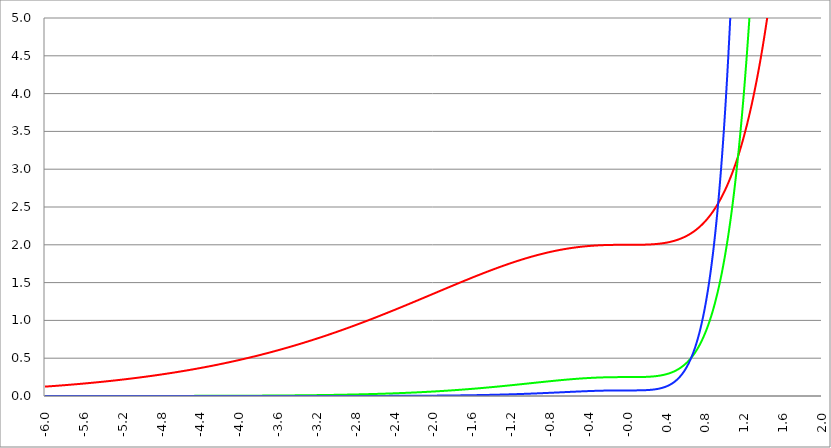
| Category | Series 1 | Series 0 | Series 2 |
|---|---|---|---|
| -6.0 | 0.124 | 0 | 0 |
| -5.996 | 0.124 | 0 | 0 |
| -5.992000000000001 | 0.125 | 0 | 0 |
| -5.988000000000001 | 0.125 | 0 | 0 |
| -5.984000000000002 | 0.125 | 0 | 0 |
| -5.980000000000002 | 0.126 | 0 | 0 |
| -5.976000000000002 | 0.126 | 0 | 0 |
| -5.972000000000003 | 0.126 | 0 | 0 |
| -5.968000000000003 | 0.127 | 0 | 0 |
| -5.964000000000004 | 0.127 | 0 | 0 |
| -5.960000000000004 | 0.128 | 0 | 0 |
| -5.956000000000004 | 0.128 | 0 | 0 |
| -5.952000000000005 | 0.128 | 0 | 0 |
| -5.948000000000005 | 0.129 | 0 | 0 |
| -5.944000000000006 | 0.129 | 0 | 0 |
| -5.940000000000006 | 0.129 | 0 | 0 |
| -5.936000000000007 | 0.13 | 0 | 0 |
| -5.932000000000007 | 0.13 | 0 | 0 |
| -5.928000000000008 | 0.131 | 0 | 0 |
| -5.924000000000008 | 0.131 | 0 | 0 |
| -5.920000000000009 | 0.131 | 0 | 0 |
| -5.91600000000001 | 0.132 | 0 | 0 |
| -5.91200000000001 | 0.132 | 0 | 0 |
| -5.90800000000001 | 0.132 | 0 | 0 |
| -5.904000000000011 | 0.133 | 0 | 0 |
| -5.900000000000011 | 0.133 | 0 | 0 |
| -5.896000000000011 | 0.134 | 0 | 0 |
| -5.892000000000012 | 0.134 | 0 | 0 |
| -5.888000000000012 | 0.134 | 0 | 0 |
| -5.884000000000013 | 0.135 | 0 | 0 |
| -5.880000000000013 | 0.135 | 0 | 0 |
| -5.876000000000014 | 0.135 | 0 | 0 |
| -5.872000000000014 | 0.136 | 0 | 0 |
| -5.868000000000014 | 0.136 | 0 | 0 |
| -5.864000000000015 | 0.137 | 0 | 0 |
| -5.860000000000015 | 0.137 | 0 | 0 |
| -5.856000000000016 | 0.137 | 0 | 0 |
| -5.852000000000016 | 0.138 | 0 | 0 |
| -5.848000000000017 | 0.138 | 0 | 0 |
| -5.844000000000017 | 0.139 | 0 | 0 |
| -5.840000000000018 | 0.139 | 0 | 0 |
| -5.836000000000018 | 0.139 | 0 | 0 |
| -5.832000000000018 | 0.14 | 0 | 0 |
| -5.828000000000019 | 0.14 | 0 | 0 |
| -5.824000000000019 | 0.141 | 0 | 0 |
| -5.82000000000002 | 0.141 | 0 | 0 |
| -5.81600000000002 | 0.141 | 0 | 0 |
| -5.812000000000021 | 0.142 | 0 | 0 |
| -5.808000000000021 | 0.142 | 0 | 0 |
| -5.804000000000022 | 0.143 | 0 | 0 |
| -5.800000000000022 | 0.143 | 0 | 0 |
| -5.796000000000022 | 0.143 | 0 | 0 |
| -5.792000000000023 | 0.144 | 0 | 0 |
| -5.788000000000023 | 0.144 | 0 | 0 |
| -5.784000000000024 | 0.145 | 0 | 0 |
| -5.780000000000024 | 0.145 | 0 | 0 |
| -5.776000000000024 | 0.145 | 0 | 0 |
| -5.772000000000025 | 0.146 | 0 | 0 |
| -5.768000000000025 | 0.146 | 0 | 0 |
| -5.764000000000026 | 0.147 | 0 | 0 |
| -5.760000000000026 | 0.147 | 0 | 0 |
| -5.756000000000026 | 0.148 | 0 | 0 |
| -5.752000000000027 | 0.148 | 0 | 0 |
| -5.748000000000027 | 0.148 | 0 | 0 |
| -5.744000000000028 | 0.149 | 0 | 0 |
| -5.740000000000028 | 0.149 | 0 | 0 |
| -5.73600000000003 | 0.15 | 0 | 0 |
| -5.73200000000003 | 0.15 | 0 | 0 |
| -5.72800000000003 | 0.151 | 0 | 0 |
| -5.72400000000003 | 0.151 | 0 | 0 |
| -5.720000000000031 | 0.151 | 0 | 0 |
| -5.716000000000031 | 0.152 | 0 | 0 |
| -5.712000000000032 | 0.152 | 0 | 0 |
| -5.708000000000032 | 0.153 | 0 | 0 |
| -5.704000000000033 | 0.153 | 0 | 0 |
| -5.700000000000033 | 0.154 | 0 | 0 |
| -5.696000000000033 | 0.154 | 0 | 0 |
| -5.692000000000034 | 0.154 | 0 | 0 |
| -5.688000000000034 | 0.155 | 0 | 0 |
| -5.684000000000035 | 0.155 | 0 | 0 |
| -5.680000000000035 | 0.156 | 0 | 0 |
| -5.676000000000035 | 0.156 | 0 | 0 |
| -5.672000000000036 | 0.157 | 0 | 0 |
| -5.668000000000036 | 0.157 | 0 | 0 |
| -5.664000000000037 | 0.158 | 0 | 0 |
| -5.660000000000037 | 0.158 | 0 | 0 |
| -5.656000000000038 | 0.158 | 0 | 0 |
| -5.652000000000038 | 0.159 | 0 | 0 |
| -5.648000000000039 | 0.159 | 0 | 0 |
| -5.644000000000039 | 0.16 | 0 | 0 |
| -5.64000000000004 | 0.16 | 0 | 0 |
| -5.63600000000004 | 0.161 | 0 | 0 |
| -5.63200000000004 | 0.161 | 0 | 0 |
| -5.628000000000041 | 0.162 | 0 | 0 |
| -5.624000000000041 | 0.162 | 0 | 0 |
| -5.620000000000042 | 0.162 | 0 | 0 |
| -5.616000000000042 | 0.163 | 0 | 0 |
| -5.612000000000043 | 0.163 | 0 | 0 |
| -5.608000000000043 | 0.164 | 0 | 0 |
| -5.604000000000044 | 0.164 | 0 | 0 |
| -5.600000000000044 | 0.165 | 0 | 0 |
| -5.596000000000044 | 0.165 | 0 | 0 |
| -5.592000000000045 | 0.166 | 0 | 0 |
| -5.588000000000045 | 0.166 | 0 | 0 |
| -5.584000000000046 | 0.167 | 0 | 0 |
| -5.580000000000046 | 0.167 | 0 | 0 |
| -5.576000000000046 | 0.168 | 0 | 0 |
| -5.572000000000047 | 0.168 | 0 | 0 |
| -5.568000000000048 | 0.169 | 0 | 0 |
| -5.564000000000048 | 0.169 | 0 | 0 |
| -5.560000000000048 | 0.169 | 0 | 0 |
| -5.556000000000049 | 0.17 | 0 | 0 |
| -5.552000000000049 | 0.17 | 0 | 0 |
| -5.54800000000005 | 0.171 | 0 | 0 |
| -5.54400000000005 | 0.171 | 0 | 0 |
| -5.540000000000051 | 0.172 | 0 | 0 |
| -5.536000000000051 | 0.172 | 0 | 0 |
| -5.532000000000052 | 0.173 | 0 | 0 |
| -5.528000000000052 | 0.173 | 0 | 0 |
| -5.524000000000052 | 0.174 | 0 | 0 |
| -5.520000000000053 | 0.174 | 0 | 0 |
| -5.516000000000053 | 0.175 | 0 | 0 |
| -5.512000000000054 | 0.175 | 0 | 0 |
| -5.508000000000054 | 0.176 | 0 | 0 |
| -5.504000000000055 | 0.176 | 0 | 0 |
| -5.500000000000055 | 0.177 | 0 | 0 |
| -5.496000000000055 | 0.177 | 0 | 0 |
| -5.492000000000056 | 0.178 | 0 | 0 |
| -5.488000000000056 | 0.178 | 0 | 0 |
| -5.484000000000057 | 0.179 | 0 | 0 |
| -5.480000000000057 | 0.179 | 0 | 0 |
| -5.476000000000057 | 0.18 | 0 | 0 |
| -5.472000000000058 | 0.18 | 0 | 0 |
| -5.468000000000059 | 0.181 | 0 | 0 |
| -5.464000000000059 | 0.181 | 0 | 0 |
| -5.460000000000059 | 0.182 | 0 | 0 |
| -5.45600000000006 | 0.182 | 0 | 0 |
| -5.45200000000006 | 0.183 | 0 | 0 |
| -5.44800000000006 | 0.183 | 0 | 0 |
| -5.444000000000061 | 0.184 | 0 | 0 |
| -5.440000000000061 | 0.184 | 0 | 0 |
| -5.436000000000062 | 0.185 | 0 | 0 |
| -5.432000000000062 | 0.185 | 0 | 0 |
| -5.428000000000063 | 0.186 | 0 | 0 |
| -5.424000000000063 | 0.186 | 0 | 0 |
| -5.420000000000064 | 0.187 | 0 | 0 |
| -5.416000000000064 | 0.187 | 0 | 0 |
| -5.412000000000064 | 0.188 | 0 | 0 |
| -5.408000000000065 | 0.188 | 0 | 0 |
| -5.404000000000065 | 0.189 | 0 | 0 |
| -5.400000000000066 | 0.19 | 0 | 0 |
| -5.396000000000066 | 0.19 | 0 | 0 |
| -5.392000000000067 | 0.191 | 0 | 0 |
| -5.388000000000067 | 0.191 | 0 | 0 |
| -5.384000000000068 | 0.192 | 0 | 0 |
| -5.380000000000068 | 0.192 | 0 | 0 |
| -5.376000000000068 | 0.193 | 0 | 0 |
| -5.37200000000007 | 0.193 | 0 | 0 |
| -5.36800000000007 | 0.194 | 0 | 0 |
| -5.36400000000007 | 0.194 | 0 | 0 |
| -5.36000000000007 | 0.195 | 0 | 0 |
| -5.356000000000071 | 0.195 | 0 | 0 |
| -5.352000000000071 | 0.196 | 0 | 0 |
| -5.348000000000072 | 0.196 | 0 | 0 |
| -5.344000000000072 | 0.197 | 0 | 0 |
| -5.340000000000073 | 0.198 | 0 | 0 |
| -5.336000000000073 | 0.198 | 0 | 0 |
| -5.332000000000074 | 0.199 | 0 | 0 |
| -5.328000000000074 | 0.199 | 0 | 0 |
| -5.324000000000074 | 0.2 | 0 | 0 |
| -5.320000000000075 | 0.2 | 0 | 0 |
| -5.316000000000075 | 0.201 | 0 | 0 |
| -5.312000000000076 | 0.201 | 0 | 0 |
| -5.308000000000076 | 0.202 | 0 | 0 |
| -5.304000000000077 | 0.203 | 0 | 0 |
| -5.300000000000077 | 0.203 | 0 | 0 |
| -5.296000000000077 | 0.204 | 0 | 0 |
| -5.292000000000078 | 0.204 | 0 | 0 |
| -5.288000000000078 | 0.205 | 0 | 0 |
| -5.284000000000079 | 0.205 | 0 | 0 |
| -5.28000000000008 | 0.206 | 0 | 0 |
| -5.27600000000008 | 0.206 | 0 | 0 |
| -5.27200000000008 | 0.207 | 0 | 0 |
| -5.268000000000081 | 0.208 | 0 | 0 |
| -5.264000000000081 | 0.208 | 0 | 0 |
| -5.260000000000081 | 0.209 | 0 | 0 |
| -5.256000000000082 | 0.209 | 0 | 0 |
| -5.252000000000082 | 0.21 | 0 | 0 |
| -5.248000000000083 | 0.211 | 0 | 0 |
| -5.244000000000083 | 0.211 | 0 | 0 |
| -5.240000000000084 | 0.212 | 0 | 0 |
| -5.236000000000084 | 0.212 | 0 | 0 |
| -5.232000000000084 | 0.213 | 0 | 0 |
| -5.228000000000085 | 0.213 | 0 | 0 |
| -5.224000000000085 | 0.214 | 0 | 0 |
| -5.220000000000086 | 0.215 | 0 | 0 |
| -5.216000000000086 | 0.215 | 0 | 0 |
| -5.212000000000087 | 0.216 | 0 | 0 |
| -5.208000000000087 | 0.216 | 0 | 0 |
| -5.204000000000088 | 0.217 | 0 | 0 |
| -5.200000000000088 | 0.218 | 0 | 0 |
| -5.196000000000089 | 0.218 | 0.001 | 0 |
| -5.192000000000089 | 0.219 | 0.001 | 0 |
| -5.188000000000089 | 0.219 | 0.001 | 0 |
| -5.18400000000009 | 0.22 | 0.001 | 0 |
| -5.18000000000009 | 0.221 | 0.001 | 0 |
| -5.176000000000091 | 0.221 | 0.001 | 0 |
| -5.172000000000091 | 0.222 | 0.001 | 0 |
| -5.168000000000092 | 0.222 | 0.001 | 0 |
| -5.164000000000092 | 0.223 | 0.001 | 0 |
| -5.160000000000092 | 0.224 | 0.001 | 0 |
| -5.156000000000093 | 0.224 | 0.001 | 0 |
| -5.152000000000093 | 0.225 | 0.001 | 0 |
| -5.148000000000094 | 0.225 | 0.001 | 0 |
| -5.144000000000094 | 0.226 | 0.001 | 0 |
| -5.140000000000095 | 0.227 | 0.001 | 0 |
| -5.136000000000095 | 0.227 | 0.001 | 0 |
| -5.132000000000096 | 0.228 | 0.001 | 0 |
| -5.128000000000096 | 0.229 | 0.001 | 0 |
| -5.124000000000096 | 0.229 | 0.001 | 0 |
| -5.120000000000097 | 0.23 | 0.001 | 0 |
| -5.116000000000097 | 0.23 | 0.001 | 0 |
| -5.112000000000098 | 0.231 | 0.001 | 0 |
| -5.108000000000098 | 0.232 | 0.001 | 0 |
| -5.104000000000099 | 0.232 | 0.001 | 0 |
| -5.100000000000099 | 0.233 | 0.001 | 0 |
| -5.0960000000001 | 0.234 | 0.001 | 0 |
| -5.0920000000001 | 0.234 | 0.001 | 0 |
| -5.0880000000001 | 0.235 | 0.001 | 0 |
| -5.084000000000101 | 0.236 | 0.001 | 0 |
| -5.080000000000101 | 0.236 | 0.001 | 0 |
| -5.076000000000101 | 0.237 | 0.001 | 0 |
| -5.072000000000102 | 0.237 | 0.001 | 0 |
| -5.068000000000103 | 0.238 | 0.001 | 0 |
| -5.064000000000103 | 0.239 | 0.001 | 0 |
| -5.060000000000104 | 0.239 | 0.001 | 0 |
| -5.056000000000104 | 0.24 | 0.001 | 0 |
| -5.052000000000104 | 0.241 | 0.001 | 0 |
| -5.048000000000104 | 0.241 | 0.001 | 0 |
| -5.044000000000105 | 0.242 | 0.001 | 0 |
| -5.040000000000105 | 0.243 | 0.001 | 0 |
| -5.036000000000106 | 0.243 | 0.001 | 0 |
| -5.032000000000106 | 0.244 | 0.001 | 0 |
| -5.028000000000107 | 0.245 | 0.001 | 0 |
| -5.024000000000107 | 0.245 | 0.001 | 0 |
| -5.020000000000108 | 0.246 | 0.001 | 0 |
| -5.016000000000108 | 0.247 | 0.001 | 0 |
| -5.012000000000109 | 0.247 | 0.001 | 0 |
| -5.00800000000011 | 0.248 | 0.001 | 0 |
| -5.00400000000011 | 0.249 | 0.001 | 0 |
| -5.00000000000011 | 0.249 | 0.001 | 0 |
| -4.99600000000011 | 0.25 | 0.001 | 0 |
| -4.992000000000111 | 0.251 | 0.001 | 0 |
| -4.988000000000111 | 0.251 | 0.001 | 0 |
| -4.984000000000112 | 0.252 | 0.001 | 0 |
| -4.980000000000112 | 0.253 | 0.001 | 0 |
| -4.976000000000112 | 0.253 | 0.001 | 0 |
| -4.972000000000113 | 0.254 | 0.001 | 0 |
| -4.968000000000114 | 0.255 | 0.001 | 0 |
| -4.964000000000114 | 0.255 | 0.001 | 0 |
| -4.960000000000114 | 0.256 | 0.001 | 0 |
| -4.956000000000114 | 0.257 | 0.001 | 0 |
| -4.952000000000115 | 0.258 | 0.001 | 0 |
| -4.948000000000115 | 0.258 | 0.001 | 0 |
| -4.944000000000116 | 0.259 | 0.001 | 0 |
| -4.940000000000116 | 0.26 | 0.001 | 0 |
| -4.936000000000117 | 0.26 | 0.001 | 0 |
| -4.932000000000117 | 0.261 | 0.001 | 0 |
| -4.928000000000118 | 0.262 | 0.001 | 0 |
| -4.924000000000118 | 0.262 | 0.001 | 0 |
| -4.920000000000119 | 0.263 | 0.001 | 0 |
| -4.91600000000012 | 0.264 | 0.001 | 0 |
| -4.91200000000012 | 0.265 | 0.001 | 0 |
| -4.90800000000012 | 0.265 | 0.001 | 0 |
| -4.90400000000012 | 0.266 | 0.001 | 0 |
| -4.90000000000012 | 0.267 | 0.001 | 0 |
| -4.896000000000121 | 0.267 | 0.001 | 0 |
| -4.892000000000122 | 0.268 | 0.001 | 0 |
| -4.888000000000122 | 0.269 | 0.001 | 0 |
| -4.884000000000123 | 0.27 | 0.001 | 0 |
| -4.880000000000123 | 0.27 | 0.001 | 0 |
| -4.876000000000123 | 0.271 | 0.001 | 0 |
| -4.872000000000124 | 0.272 | 0.001 | 0 |
| -4.868000000000124 | 0.272 | 0.001 | 0 |
| -4.864000000000125 | 0.273 | 0.001 | 0 |
| -4.860000000000125 | 0.274 | 0.001 | 0 |
| -4.856000000000125 | 0.275 | 0.001 | 0 |
| -4.852000000000126 | 0.275 | 0.001 | 0 |
| -4.848000000000126 | 0.276 | 0.001 | 0 |
| -4.844000000000127 | 0.277 | 0.001 | 0 |
| -4.840000000000127 | 0.278 | 0.001 | 0 |
| -4.836000000000128 | 0.278 | 0.001 | 0 |
| -4.832000000000128 | 0.279 | 0.001 | 0 |
| -4.82800000000013 | 0.28 | 0.001 | 0 |
| -4.824000000000129 | 0.281 | 0.001 | 0 |
| -4.82000000000013 | 0.281 | 0.001 | 0 |
| -4.81600000000013 | 0.282 | 0.001 | 0 |
| -4.812000000000131 | 0.283 | 0.001 | 0 |
| -4.808000000000131 | 0.284 | 0.001 | 0 |
| -4.804000000000132 | 0.284 | 0.001 | 0 |
| -4.800000000000132 | 0.285 | 0.001 | 0 |
| -4.796000000000132 | 0.286 | 0.001 | 0 |
| -4.792000000000133 | 0.287 | 0.001 | 0 |
| -4.788000000000133 | 0.287 | 0.001 | 0 |
| -4.784000000000134 | 0.288 | 0.001 | 0 |
| -4.780000000000134 | 0.289 | 0.001 | 0 |
| -4.776000000000134 | 0.29 | 0.001 | 0 |
| -4.772000000000135 | 0.29 | 0.001 | 0 |
| -4.768000000000135 | 0.291 | 0.001 | 0 |
| -4.764000000000136 | 0.292 | 0.001 | 0 |
| -4.760000000000136 | 0.293 | 0.001 | 0 |
| -4.756000000000136 | 0.294 | 0.001 | 0 |
| -4.752000000000137 | 0.294 | 0.001 | 0 |
| -4.748000000000137 | 0.295 | 0.001 | 0 |
| -4.744000000000138 | 0.296 | 0.001 | 0 |
| -4.740000000000138 | 0.297 | 0.001 | 0 |
| -4.73600000000014 | 0.297 | 0.001 | 0 |
| -4.73200000000014 | 0.298 | 0.001 | 0 |
| -4.72800000000014 | 0.299 | 0.001 | 0 |
| -4.72400000000014 | 0.3 | 0.001 | 0 |
| -4.720000000000141 | 0.301 | 0.001 | 0 |
| -4.716000000000141 | 0.301 | 0.001 | 0 |
| -4.712000000000142 | 0.302 | 0.001 | 0 |
| -4.708000000000142 | 0.303 | 0.001 | 0 |
| -4.704000000000143 | 0.304 | 0.001 | 0 |
| -4.700000000000143 | 0.305 | 0.001 | 0 |
| -4.696000000000143 | 0.305 | 0.001 | 0 |
| -4.692000000000144 | 0.306 | 0.001 | 0 |
| -4.688000000000144 | 0.307 | 0.001 | 0 |
| -4.684000000000145 | 0.308 | 0.001 | 0 |
| -4.680000000000145 | 0.309 | 0.001 | 0 |
| -4.676000000000145 | 0.309 | 0.001 | 0 |
| -4.672000000000146 | 0.31 | 0.001 | 0 |
| -4.668000000000147 | 0.311 | 0.001 | 0 |
| -4.664000000000147 | 0.312 | 0.001 | 0 |
| -4.660000000000147 | 0.313 | 0.001 | 0 |
| -4.656000000000148 | 0.314 | 0.001 | 0 |
| -4.652000000000148 | 0.314 | 0.001 | 0 |
| -4.648000000000149 | 0.315 | 0.001 | 0 |
| -4.644000000000149 | 0.316 | 0.001 | 0 |
| -4.64000000000015 | 0.317 | 0.001 | 0 |
| -4.63600000000015 | 0.318 | 0.001 | 0 |
| -4.632000000000151 | 0.319 | 0.001 | 0 |
| -4.628000000000151 | 0.319 | 0.001 | 0 |
| -4.624000000000151 | 0.32 | 0.001 | 0 |
| -4.620000000000152 | 0.321 | 0.001 | 0 |
| -4.616000000000152 | 0.322 | 0.001 | 0 |
| -4.612000000000153 | 0.323 | 0.001 | 0 |
| -4.608000000000153 | 0.324 | 0.001 | 0 |
| -4.604000000000154 | 0.324 | 0.001 | 0 |
| -4.600000000000154 | 0.325 | 0.001 | 0 |
| -4.596000000000154 | 0.326 | 0.001 | 0 |
| -4.592000000000155 | 0.327 | 0.001 | 0 |
| -4.588000000000155 | 0.328 | 0.001 | 0 |
| -4.584000000000156 | 0.329 | 0.001 | 0 |
| -4.580000000000156 | 0.33 | 0.001 | 0 |
| -4.576000000000156 | 0.33 | 0.001 | 0 |
| -4.572000000000157 | 0.331 | 0.001 | 0 |
| -4.568000000000158 | 0.332 | 0.001 | 0 |
| -4.564000000000158 | 0.333 | 0.001 | 0 |
| -4.560000000000159 | 0.334 | 0.001 | 0 |
| -4.55600000000016 | 0.335 | 0.001 | 0 |
| -4.552000000000159 | 0.336 | 0.001 | 0 |
| -4.54800000000016 | 0.337 | 0.001 | 0 |
| -4.54400000000016 | 0.337 | 0.001 | 0 |
| -4.54000000000016 | 0.338 | 0.001 | 0 |
| -4.53600000000016 | 0.339 | 0.001 | 0 |
| -4.532000000000161 | 0.34 | 0.001 | 0 |
| -4.528000000000162 | 0.341 | 0.001 | 0 |
| -4.524000000000163 | 0.342 | 0.001 | 0 |
| -4.520000000000163 | 0.343 | 0.002 | 0 |
| -4.516000000000163 | 0.344 | 0.002 | 0 |
| -4.512000000000164 | 0.344 | 0.002 | 0 |
| -4.508000000000164 | 0.345 | 0.002 | 0 |
| -4.504000000000164 | 0.346 | 0.002 | 0 |
| -4.500000000000165 | 0.347 | 0.002 | 0 |
| -4.496000000000165 | 0.348 | 0.002 | 0 |
| -4.492000000000166 | 0.349 | 0.002 | 0 |
| -4.488000000000166 | 0.35 | 0.002 | 0 |
| -4.484000000000166 | 0.351 | 0.002 | 0 |
| -4.480000000000167 | 0.352 | 0.002 | 0 |
| -4.476000000000167 | 0.353 | 0.002 | 0 |
| -4.472000000000168 | 0.354 | 0.002 | 0 |
| -4.468000000000168 | 0.354 | 0.002 | 0 |
| -4.46400000000017 | 0.355 | 0.002 | 0 |
| -4.46000000000017 | 0.356 | 0.002 | 0 |
| -4.45600000000017 | 0.357 | 0.002 | 0 |
| -4.45200000000017 | 0.358 | 0.002 | 0 |
| -4.44800000000017 | 0.359 | 0.002 | 0 |
| -4.444000000000171 | 0.36 | 0.002 | 0 |
| -4.440000000000171 | 0.361 | 0.002 | 0 |
| -4.436000000000172 | 0.362 | 0.002 | 0 |
| -4.432000000000172 | 0.363 | 0.002 | 0 |
| -4.428000000000173 | 0.364 | 0.002 | 0 |
| -4.424000000000174 | 0.365 | 0.002 | 0 |
| -4.420000000000174 | 0.366 | 0.002 | 0 |
| -4.416000000000174 | 0.366 | 0.002 | 0 |
| -4.412000000000174 | 0.367 | 0.002 | 0 |
| -4.408000000000175 | 0.368 | 0.002 | 0 |
| -4.404000000000175 | 0.369 | 0.002 | 0 |
| -4.400000000000176 | 0.37 | 0.002 | 0 |
| -4.396000000000176 | 0.371 | 0.002 | 0 |
| -4.392000000000177 | 0.372 | 0.002 | 0 |
| -4.388000000000177 | 0.373 | 0.002 | 0 |
| -4.384000000000178 | 0.374 | 0.002 | 0 |
| -4.380000000000178 | 0.375 | 0.002 | 0 |
| -4.376000000000178 | 0.376 | 0.002 | 0 |
| -4.37200000000018 | 0.377 | 0.002 | 0 |
| -4.36800000000018 | 0.378 | 0.002 | 0 |
| -4.36400000000018 | 0.379 | 0.002 | 0 |
| -4.360000000000181 | 0.38 | 0.002 | 0 |
| -4.356000000000181 | 0.381 | 0.002 | 0 |
| -4.352000000000181 | 0.382 | 0.002 | 0 |
| -4.348000000000182 | 0.383 | 0.002 | 0 |
| -4.344000000000182 | 0.384 | 0.002 | 0 |
| -4.340000000000183 | 0.385 | 0.002 | 0 |
| -4.336000000000183 | 0.386 | 0.002 | 0 |
| -4.332000000000184 | 0.387 | 0.002 | 0 |
| -4.328000000000184 | 0.388 | 0.002 | 0 |
| -4.324000000000185 | 0.389 | 0.002 | 0 |
| -4.320000000000185 | 0.39 | 0.002 | 0 |
| -4.316000000000185 | 0.391 | 0.002 | 0 |
| -4.312000000000186 | 0.392 | 0.002 | 0 |
| -4.308000000000186 | 0.393 | 0.002 | 0 |
| -4.304000000000187 | 0.394 | 0.002 | 0 |
| -4.300000000000187 | 0.395 | 0.002 | 0 |
| -4.296000000000187 | 0.396 | 0.002 | 0 |
| -4.292000000000188 | 0.397 | 0.002 | 0 |
| -4.288000000000188 | 0.398 | 0.002 | 0 |
| -4.284000000000189 | 0.399 | 0.002 | 0 |
| -4.28000000000019 | 0.4 | 0.002 | 0 |
| -4.27600000000019 | 0.401 | 0.002 | 0 |
| -4.27200000000019 | 0.402 | 0.002 | 0 |
| -4.268000000000191 | 0.403 | 0.002 | 0 |
| -4.264000000000191 | 0.404 | 0.002 | 0 |
| -4.260000000000192 | 0.405 | 0.002 | 0 |
| -4.256000000000192 | 0.406 | 0.002 | 0 |
| -4.252000000000192 | 0.407 | 0.002 | 0 |
| -4.248000000000193 | 0.408 | 0.002 | 0 |
| -4.244000000000193 | 0.409 | 0.002 | 0 |
| -4.240000000000194 | 0.41 | 0.002 | 0 |
| -4.236000000000194 | 0.411 | 0.002 | 0 |
| -4.232000000000194 | 0.412 | 0.002 | 0 |
| -4.228000000000195 | 0.413 | 0.002 | 0 |
| -4.224000000000196 | 0.414 | 0.002 | 0 |
| -4.220000000000196 | 0.415 | 0.002 | 0 |
| -4.216000000000196 | 0.416 | 0.002 | 0 |
| -4.212000000000197 | 0.417 | 0.002 | 0 |
| -4.208000000000197 | 0.418 | 0.002 | 0 |
| -4.204000000000198 | 0.419 | 0.002 | 0 |
| -4.200000000000198 | 0.42 | 0.003 | 0 |
| -4.196000000000199 | 0.422 | 0.003 | 0 |
| -4.192000000000199 | 0.423 | 0.003 | 0 |
| -4.1880000000002 | 0.424 | 0.003 | 0 |
| -4.1840000000002 | 0.425 | 0.003 | 0 |
| -4.1800000000002 | 0.426 | 0.003 | 0 |
| -4.176000000000201 | 0.427 | 0.003 | 0 |
| -4.172000000000201 | 0.428 | 0.003 | 0 |
| -4.168000000000202 | 0.429 | 0.003 | 0 |
| -4.164000000000202 | 0.43 | 0.003 | 0 |
| -4.160000000000203 | 0.431 | 0.003 | 0 |
| -4.156000000000203 | 0.432 | 0.003 | 0 |
| -4.152000000000204 | 0.433 | 0.003 | 0 |
| -4.148000000000204 | 0.434 | 0.003 | 0 |
| -4.144000000000204 | 0.436 | 0.003 | 0 |
| -4.140000000000205 | 0.437 | 0.003 | 0 |
| -4.136000000000205 | 0.438 | 0.003 | 0 |
| -4.132000000000206 | 0.439 | 0.003 | 0 |
| -4.128000000000206 | 0.44 | 0.003 | 0 |
| -4.124000000000207 | 0.441 | 0.003 | 0 |
| -4.120000000000207 | 0.442 | 0.003 | 0 |
| -4.116000000000207 | 0.443 | 0.003 | 0 |
| -4.112000000000208 | 0.444 | 0.003 | 0 |
| -4.108000000000208 | 0.445 | 0.003 | 0 |
| -4.104000000000209 | 0.447 | 0.003 | 0 |
| -4.100000000000209 | 0.448 | 0.003 | 0 |
| -4.09600000000021 | 0.449 | 0.003 | 0 |
| -4.09200000000021 | 0.45 | 0.003 | 0 |
| -4.088000000000211 | 0.451 | 0.003 | 0 |
| -4.084000000000211 | 0.452 | 0.003 | 0 |
| -4.080000000000211 | 0.453 | 0.003 | 0 |
| -4.076000000000212 | 0.454 | 0.003 | 0 |
| -4.072000000000212 | 0.455 | 0.003 | 0 |
| -4.068000000000213 | 0.457 | 0.003 | 0 |
| -4.064000000000213 | 0.458 | 0.003 | 0 |
| -4.060000000000214 | 0.459 | 0.003 | 0 |
| -4.056000000000214 | 0.46 | 0.003 | 0 |
| -4.052000000000215 | 0.461 | 0.003 | 0 |
| -4.048000000000215 | 0.462 | 0.003 | 0 |
| -4.044000000000215 | 0.463 | 0.003 | 0 |
| -4.040000000000216 | 0.465 | 0.003 | 0 |
| -4.036000000000216 | 0.466 | 0.003 | 0 |
| -4.032000000000217 | 0.467 | 0.003 | 0 |
| -4.028000000000217 | 0.468 | 0.003 | 0 |
| -4.024000000000218 | 0.469 | 0.003 | 0 |
| -4.020000000000218 | 0.47 | 0.003 | 0 |
| -4.016000000000219 | 0.472 | 0.003 | 0 |
| -4.012000000000219 | 0.473 | 0.003 | 0 |
| -4.008000000000219 | 0.474 | 0.003 | 0 |
| -4.00400000000022 | 0.475 | 0.003 | 0 |
| -4.00000000000022 | 0.476 | 0.003 | 0 |
| -3.99600000000022 | 0.477 | 0.003 | 0 |
| -3.99200000000022 | 0.479 | 0.003 | 0 |
| -3.98800000000022 | 0.48 | 0.004 | 0 |
| -3.98400000000022 | 0.481 | 0.004 | 0 |
| -3.98000000000022 | 0.482 | 0.004 | 0 |
| -3.97600000000022 | 0.483 | 0.004 | 0 |
| -3.97200000000022 | 0.484 | 0.004 | 0 |
| -3.96800000000022 | 0.486 | 0.004 | 0 |
| -3.96400000000022 | 0.487 | 0.004 | 0 |
| -3.96000000000022 | 0.488 | 0.004 | 0 |
| -3.95600000000022 | 0.489 | 0.004 | 0 |
| -3.95200000000022 | 0.49 | 0.004 | 0 |
| -3.94800000000022 | 0.492 | 0.004 | 0 |
| -3.94400000000022 | 0.493 | 0.004 | 0 |
| -3.94000000000022 | 0.494 | 0.004 | 0 |
| -3.93600000000022 | 0.495 | 0.004 | 0 |
| -3.93200000000022 | 0.496 | 0.004 | 0 |
| -3.92800000000022 | 0.498 | 0.004 | 0 |
| -3.92400000000022 | 0.499 | 0.004 | 0 |
| -3.92000000000022 | 0.5 | 0.004 | 0 |
| -3.91600000000022 | 0.501 | 0.004 | 0 |
| -3.91200000000022 | 0.503 | 0.004 | 0 |
| -3.90800000000022 | 0.504 | 0.004 | 0 |
| -3.90400000000022 | 0.505 | 0.004 | 0 |
| -3.90000000000022 | 0.506 | 0.004 | 0 |
| -3.89600000000022 | 0.507 | 0.004 | 0 |
| -3.89200000000022 | 0.509 | 0.004 | 0 |
| -3.88800000000022 | 0.51 | 0.004 | 0 |
| -3.88400000000022 | 0.511 | 0.004 | 0 |
| -3.88000000000022 | 0.512 | 0.004 | 0 |
| -3.87600000000022 | 0.514 | 0.004 | 0 |
| -3.87200000000022 | 0.515 | 0.004 | 0 |
| -3.86800000000022 | 0.516 | 0.004 | 0 |
| -3.86400000000022 | 0.517 | 0.004 | 0 |
| -3.86000000000022 | 0.519 | 0.004 | 0 |
| -3.85600000000022 | 0.52 | 0.004 | 0 |
| -3.85200000000022 | 0.521 | 0.004 | 0 |
| -3.84800000000022 | 0.522 | 0.004 | 0 |
| -3.84400000000022 | 0.524 | 0.004 | 0 |
| -3.84000000000022 | 0.525 | 0.004 | 0 |
| -3.83600000000022 | 0.526 | 0.004 | 0 |
| -3.83200000000022 | 0.528 | 0.004 | 0 |
| -3.82800000000022 | 0.529 | 0.004 | 0 |
| -3.82400000000022 | 0.53 | 0.005 | 0 |
| -3.82000000000022 | 0.531 | 0.005 | 0 |
| -3.81600000000022 | 0.533 | 0.005 | 0 |
| -3.81200000000022 | 0.534 | 0.005 | 0 |
| -3.80800000000022 | 0.535 | 0.005 | 0 |
| -3.80400000000022 | 0.537 | 0.005 | 0 |
| -3.80000000000022 | 0.538 | 0.005 | 0 |
| -3.79600000000022 | 0.539 | 0.005 | 0 |
| -3.79200000000022 | 0.54 | 0.005 | 0 |
| -3.78800000000022 | 0.542 | 0.005 | 0 |
| -3.78400000000022 | 0.543 | 0.005 | 0 |
| -3.78000000000022 | 0.544 | 0.005 | 0 |
| -3.77600000000022 | 0.546 | 0.005 | 0 |
| -3.77200000000022 | 0.547 | 0.005 | 0 |
| -3.76800000000022 | 0.548 | 0.005 | 0 |
| -3.76400000000022 | 0.55 | 0.005 | 0 |
| -3.76000000000022 | 0.551 | 0.005 | 0 |
| -3.75600000000022 | 0.552 | 0.005 | 0 |
| -3.75200000000022 | 0.553 | 0.005 | 0 |
| -3.74800000000022 | 0.555 | 0.005 | 0 |
| -3.74400000000022 | 0.556 | 0.005 | 0 |
| -3.74000000000022 | 0.557 | 0.005 | 0 |
| -3.73600000000022 | 0.559 | 0.005 | 0 |
| -3.73200000000022 | 0.56 | 0.005 | 0 |
| -3.72800000000022 | 0.561 | 0.005 | 0 |
| -3.72400000000022 | 0.563 | 0.005 | 0 |
| -3.72000000000022 | 0.564 | 0.005 | 0 |
| -3.71600000000022 | 0.565 | 0.005 | 0 |
| -3.71200000000022 | 0.567 | 0.005 | 0 |
| -3.70800000000022 | 0.568 | 0.005 | 0 |
| -3.70400000000022 | 0.57 | 0.005 | 0 |
| -3.70000000000022 | 0.571 | 0.005 | 0 |
| -3.69600000000022 | 0.572 | 0.006 | 0 |
| -3.69200000000022 | 0.574 | 0.006 | 0 |
| -3.68800000000022 | 0.575 | 0.006 | 0 |
| -3.68400000000022 | 0.576 | 0.006 | 0 |
| -3.68000000000022 | 0.578 | 0.006 | 0 |
| -3.67600000000022 | 0.579 | 0.006 | 0 |
| -3.67200000000022 | 0.58 | 0.006 | 0 |
| -3.66800000000022 | 0.582 | 0.006 | 0 |
| -3.66400000000022 | 0.583 | 0.006 | 0 |
| -3.66000000000022 | 0.585 | 0.006 | 0 |
| -3.65600000000022 | 0.586 | 0.006 | 0 |
| -3.65200000000022 | 0.587 | 0.006 | 0 |
| -3.64800000000022 | 0.589 | 0.006 | 0 |
| -3.64400000000022 | 0.59 | 0.006 | 0 |
| -3.64000000000022 | 0.591 | 0.006 | 0 |
| -3.63600000000022 | 0.593 | 0.006 | 0 |
| -3.63200000000022 | 0.594 | 0.006 | 0 |
| -3.62800000000022 | 0.596 | 0.006 | 0 |
| -3.62400000000022 | 0.597 | 0.006 | 0 |
| -3.62000000000022 | 0.598 | 0.006 | 0 |
| -3.61600000000022 | 0.6 | 0.006 | 0 |
| -3.61200000000022 | 0.601 | 0.006 | 0 |
| -3.60800000000022 | 0.603 | 0.006 | 0 |
| -3.60400000000022 | 0.604 | 0.006 | 0 |
| -3.60000000000022 | 0.605 | 0.006 | 0 |
| -3.59600000000022 | 0.607 | 0.006 | 0 |
| -3.59200000000022 | 0.608 | 0.006 | 0 |
| -3.58800000000022 | 0.61 | 0.006 | 0 |
| -3.58400000000022 | 0.611 | 0.007 | 0 |
| -3.58000000000022 | 0.613 | 0.007 | 0 |
| -3.57600000000022 | 0.614 | 0.007 | 0 |
| -3.57200000000022 | 0.615 | 0.007 | 0 |
| -3.56800000000022 | 0.617 | 0.007 | 0 |
| -3.56400000000022 | 0.618 | 0.007 | 0 |
| -3.56000000000022 | 0.62 | 0.007 | 0 |
| -3.55600000000022 | 0.621 | 0.007 | 0 |
| -3.55200000000022 | 0.623 | 0.007 | 0 |
| -3.54800000000022 | 0.624 | 0.007 | 0 |
| -3.54400000000022 | 0.626 | 0.007 | 0 |
| -3.54000000000022 | 0.627 | 0.007 | 0 |
| -3.53600000000022 | 0.628 | 0.007 | 0 |
| -3.53200000000022 | 0.63 | 0.007 | 0 |
| -3.52800000000022 | 0.631 | 0.007 | 0 |
| -3.52400000000022 | 0.633 | 0.007 | 0 |
| -3.52000000000022 | 0.634 | 0.007 | 0 |
| -3.51600000000022 | 0.636 | 0.007 | 0 |
| -3.51200000000022 | 0.637 | 0.007 | 0 |
| -3.50800000000022 | 0.639 | 0.007 | 0 |
| -3.50400000000022 | 0.64 | 0.007 | 0 |
| -3.50000000000022 | 0.642 | 0.007 | 0 |
| -3.49600000000022 | 0.643 | 0.007 | 0 |
| -3.49200000000022 | 0.645 | 0.007 | 0 |
| -3.48800000000022 | 0.646 | 0.008 | 0 |
| -3.48400000000022 | 0.648 | 0.008 | 0 |
| -3.48000000000022 | 0.649 | 0.008 | 0 |
| -3.47600000000022 | 0.651 | 0.008 | 0 |
| -3.47200000000022 | 0.652 | 0.008 | 0 |
| -3.46800000000022 | 0.654 | 0.008 | 0 |
| -3.46400000000022 | 0.655 | 0.008 | 0 |
| -3.46000000000022 | 0.657 | 0.008 | 0 |
| -3.45600000000022 | 0.658 | 0.008 | 0 |
| -3.45200000000022 | 0.66 | 0.008 | 0 |
| -3.44800000000022 | 0.661 | 0.008 | 0 |
| -3.44400000000022 | 0.663 | 0.008 | 0 |
| -3.44000000000022 | 0.664 | 0.008 | 0 |
| -3.43600000000022 | 0.666 | 0.008 | 0 |
| -3.43200000000022 | 0.667 | 0.008 | 0 |
| -3.42800000000022 | 0.669 | 0.008 | 0 |
| -3.42400000000022 | 0.67 | 0.008 | 0 |
| -3.42000000000022 | 0.672 | 0.008 | 0 |
| -3.41600000000022 | 0.673 | 0.008 | 0 |
| -3.41200000000022 | 0.675 | 0.008 | 0 |
| -3.40800000000022 | 0.676 | 0.009 | 0 |
| -3.40400000000022 | 0.678 | 0.009 | 0 |
| -3.40000000000022 | 0.679 | 0.009 | 0 |
| -3.39600000000022 | 0.681 | 0.009 | 0 |
| -3.39200000000022 | 0.683 | 0.009 | 0 |
| -3.38800000000022 | 0.684 | 0.009 | 0 |
| -3.38400000000022 | 0.686 | 0.009 | 0 |
| -3.38000000000022 | 0.687 | 0.009 | 0 |
| -3.37600000000022 | 0.689 | 0.009 | 0 |
| -3.37200000000022 | 0.69 | 0.009 | 0 |
| -3.36800000000022 | 0.692 | 0.009 | 0 |
| -3.36400000000022 | 0.693 | 0.009 | 0 |
| -3.36000000000022 | 0.695 | 0.009 | 0 |
| -3.35600000000022 | 0.697 | 0.009 | 0 |
| -3.35200000000022 | 0.698 | 0.009 | 0 |
| -3.34800000000022 | 0.7 | 0.009 | 0 |
| -3.34400000000022 | 0.701 | 0.009 | 0 |
| -3.34000000000022 | 0.703 | 0.009 | 0 |
| -3.33600000000022 | 0.704 | 0.009 | 0 |
| -3.33200000000022 | 0.706 | 0.01 | 0 |
| -3.32800000000022 | 0.708 | 0.01 | 0 |
| -3.32400000000022 | 0.709 | 0.01 | 0 |
| -3.32000000000022 | 0.711 | 0.01 | 0 |
| -3.31600000000022 | 0.712 | 0.01 | 0 |
| -3.31200000000022 | 0.714 | 0.01 | 0 |
| -3.30800000000022 | 0.716 | 0.01 | 0 |
| -3.30400000000022 | 0.717 | 0.01 | 0 |
| -3.30000000000022 | 0.719 | 0.01 | 0 |
| -3.29600000000022 | 0.72 | 0.01 | 0 |
| -3.29200000000022 | 0.722 | 0.01 | 0 |
| -3.28800000000022 | 0.724 | 0.01 | 0 |
| -3.28400000000022 | 0.725 | 0.01 | 0 |
| -3.28000000000022 | 0.727 | 0.01 | 0 |
| -3.27600000000022 | 0.729 | 0.01 | 0 |
| -3.27200000000022 | 0.73 | 0.01 | 0 |
| -3.26800000000022 | 0.732 | 0.01 | 0 |
| -3.26400000000022 | 0.733 | 0.011 | 0 |
| -3.26000000000022 | 0.735 | 0.011 | 0 |
| -3.25600000000022 | 0.737 | 0.011 | 0 |
| -3.25200000000022 | 0.738 | 0.011 | 0 |
| -3.24800000000022 | 0.74 | 0.011 | 0 |
| -3.24400000000022 | 0.742 | 0.011 | 0 |
| -3.24000000000022 | 0.743 | 0.011 | 0 |
| -3.23600000000022 | 0.745 | 0.011 | 0 |
| -3.23200000000022 | 0.747 | 0.011 | 0 |
| -3.22800000000022 | 0.748 | 0.011 | 0 |
| -3.22400000000022 | 0.75 | 0.011 | 0 |
| -3.22000000000022 | 0.751 | 0.011 | 0 |
| -3.21600000000022 | 0.753 | 0.011 | 0 |
| -3.21200000000022 | 0.755 | 0.011 | 0 |
| -3.20800000000022 | 0.756 | 0.011 | 0 |
| -3.20400000000022 | 0.758 | 0.012 | 0 |
| -3.20000000000022 | 0.76 | 0.012 | 0 |
| -3.19600000000022 | 0.761 | 0.012 | 0 |
| -3.19200000000022 | 0.763 | 0.012 | 0 |
| -3.18800000000022 | 0.765 | 0.012 | 0 |
| -3.18400000000022 | 0.767 | 0.012 | 0 |
| -3.18000000000022 | 0.768 | 0.012 | 0 |
| -3.17600000000022 | 0.77 | 0.012 | 0 |
| -3.17200000000022 | 0.772 | 0.012 | 0 |
| -3.16800000000022 | 0.773 | 0.012 | 0 |
| -3.16400000000022 | 0.775 | 0.012 | 0 |
| -3.16000000000022 | 0.777 | 0.012 | 0 |
| -3.15600000000022 | 0.778 | 0.012 | 0 |
| -3.152000000000219 | 0.78 | 0.012 | 0 |
| -3.148000000000219 | 0.782 | 0.012 | 0 |
| -3.144000000000219 | 0.783 | 0.013 | 0 |
| -3.140000000000219 | 0.785 | 0.013 | 0 |
| -3.136000000000219 | 0.787 | 0.013 | 0 |
| -3.132000000000219 | 0.789 | 0.013 | 0 |
| -3.128000000000219 | 0.79 | 0.013 | 0 |
| -3.124000000000219 | 0.792 | 0.013 | 0 |
| -3.120000000000219 | 0.794 | 0.013 | 0 |
| -3.116000000000219 | 0.795 | 0.013 | 0 |
| -3.112000000000219 | 0.797 | 0.013 | 0 |
| -3.108000000000219 | 0.799 | 0.013 | 0 |
| -3.104000000000219 | 0.801 | 0.013 | 0 |
| -3.100000000000219 | 0.802 | 0.013 | 0 |
| -3.096000000000219 | 0.804 | 0.013 | 0 |
| -3.092000000000219 | 0.806 | 0.014 | 0 |
| -3.088000000000219 | 0.808 | 0.014 | 0 |
| -3.084000000000219 | 0.809 | 0.014 | 0 |
| -3.080000000000219 | 0.811 | 0.014 | 0 |
| -3.076000000000219 | 0.813 | 0.014 | 0 |
| -3.072000000000219 | 0.815 | 0.014 | 0 |
| -3.068000000000219 | 0.816 | 0.014 | 0 |
| -3.064000000000219 | 0.818 | 0.014 | 0 |
| -3.060000000000219 | 0.82 | 0.014 | 0 |
| -3.056000000000219 | 0.822 | 0.014 | 0 |
| -3.052000000000219 | 0.823 | 0.014 | 0 |
| -3.048000000000219 | 0.825 | 0.014 | 0 |
| -3.044000000000219 | 0.827 | 0.015 | 0 |
| -3.040000000000219 | 0.829 | 0.015 | 0 |
| -3.036000000000219 | 0.83 | 0.015 | 0 |
| -3.032000000000219 | 0.832 | 0.015 | 0 |
| -3.028000000000219 | 0.834 | 0.015 | 0 |
| -3.024000000000219 | 0.836 | 0.015 | 0 |
| -3.020000000000219 | 0.837 | 0.015 | 0 |
| -3.016000000000219 | 0.839 | 0.015 | 0 |
| -3.012000000000219 | 0.841 | 0.015 | 0 |
| -3.008000000000219 | 0.843 | 0.015 | 0 |
| -3.004000000000219 | 0.845 | 0.015 | 0 |
| -3.000000000000219 | 0.846 | 0.015 | 0 |
| -2.996000000000219 | 0.848 | 0.016 | 0 |
| -2.992000000000219 | 0.85 | 0.016 | 0 |
| -2.988000000000219 | 0.852 | 0.016 | 0 |
| -2.984000000000219 | 0.854 | 0.016 | 0 |
| -2.980000000000219 | 0.855 | 0.016 | 0 |
| -2.976000000000219 | 0.857 | 0.016 | 0 |
| -2.972000000000219 | 0.859 | 0.016 | 0 |
| -2.968000000000219 | 0.861 | 0.016 | 0 |
| -2.964000000000219 | 0.863 | 0.016 | 0.001 |
| -2.960000000000219 | 0.864 | 0.016 | 0.001 |
| -2.956000000000219 | 0.866 | 0.017 | 0.001 |
| -2.952000000000219 | 0.868 | 0.017 | 0.001 |
| -2.948000000000219 | 0.87 | 0.017 | 0.001 |
| -2.944000000000219 | 0.872 | 0.017 | 0.001 |
| -2.940000000000219 | 0.874 | 0.017 | 0.001 |
| -2.936000000000219 | 0.875 | 0.017 | 0.001 |
| -2.932000000000219 | 0.877 | 0.017 | 0.001 |
| -2.928000000000219 | 0.879 | 0.017 | 0.001 |
| -2.924000000000219 | 0.881 | 0.017 | 0.001 |
| -2.920000000000219 | 0.883 | 0.017 | 0.001 |
| -2.916000000000219 | 0.885 | 0.017 | 0.001 |
| -2.912000000000219 | 0.886 | 0.018 | 0.001 |
| -2.908000000000219 | 0.888 | 0.018 | 0.001 |
| -2.904000000000219 | 0.89 | 0.018 | 0.001 |
| -2.900000000000219 | 0.892 | 0.018 | 0.001 |
| -2.896000000000219 | 0.894 | 0.018 | 0.001 |
| -2.892000000000219 | 0.896 | 0.018 | 0.001 |
| -2.888000000000219 | 0.897 | 0.018 | 0.001 |
| -2.884000000000219 | 0.899 | 0.018 | 0.001 |
| -2.880000000000219 | 0.901 | 0.018 | 0.001 |
| -2.876000000000219 | 0.903 | 0.018 | 0.001 |
| -2.872000000000219 | 0.905 | 0.019 | 0.001 |
| -2.868000000000219 | 0.907 | 0.019 | 0.001 |
| -2.864000000000219 | 0.909 | 0.019 | 0.001 |
| -2.860000000000219 | 0.911 | 0.019 | 0.001 |
| -2.856000000000219 | 0.912 | 0.019 | 0.001 |
| -2.852000000000219 | 0.914 | 0.019 | 0.001 |
| -2.848000000000219 | 0.916 | 0.019 | 0.001 |
| -2.844000000000219 | 0.918 | 0.019 | 0.001 |
| -2.840000000000219 | 0.92 | 0.019 | 0.001 |
| -2.836000000000219 | 0.922 | 0.02 | 0.001 |
| -2.832000000000219 | 0.924 | 0.02 | 0.001 |
| -2.828000000000219 | 0.926 | 0.02 | 0.001 |
| -2.824000000000219 | 0.928 | 0.02 | 0.001 |
| -2.820000000000219 | 0.929 | 0.02 | 0.001 |
| -2.816000000000219 | 0.931 | 0.02 | 0.001 |
| -2.812000000000219 | 0.933 | 0.02 | 0.001 |
| -2.808000000000219 | 0.935 | 0.02 | 0.001 |
| -2.804000000000219 | 0.937 | 0.02 | 0.001 |
| -2.800000000000219 | 0.939 | 0.021 | 0.001 |
| -2.796000000000219 | 0.941 | 0.021 | 0.001 |
| -2.792000000000219 | 0.943 | 0.021 | 0.001 |
| -2.78800000000022 | 0.945 | 0.021 | 0.001 |
| -2.78400000000022 | 0.947 | 0.021 | 0.001 |
| -2.78000000000022 | 0.948 | 0.021 | 0.001 |
| -2.776000000000219 | 0.95 | 0.021 | 0.001 |
| -2.772000000000219 | 0.952 | 0.021 | 0.001 |
| -2.76800000000022 | 0.954 | 0.022 | 0.001 |
| -2.76400000000022 | 0.956 | 0.022 | 0.001 |
| -2.76000000000022 | 0.958 | 0.022 | 0.001 |
| -2.756000000000219 | 0.96 | 0.022 | 0.001 |
| -2.752000000000219 | 0.962 | 0.022 | 0.001 |
| -2.74800000000022 | 0.964 | 0.022 | 0.001 |
| -2.74400000000022 | 0.966 | 0.022 | 0.001 |
| -2.74000000000022 | 0.968 | 0.022 | 0.001 |
| -2.736000000000219 | 0.97 | 0.023 | 0.001 |
| -2.732000000000219 | 0.972 | 0.023 | 0.001 |
| -2.72800000000022 | 0.974 | 0.023 | 0.001 |
| -2.72400000000022 | 0.976 | 0.023 | 0.001 |
| -2.72000000000022 | 0.977 | 0.023 | 0.001 |
| -2.716000000000219 | 0.979 | 0.023 | 0.001 |
| -2.712000000000219 | 0.981 | 0.023 | 0.001 |
| -2.70800000000022 | 0.983 | 0.023 | 0.001 |
| -2.70400000000022 | 0.985 | 0.024 | 0.001 |
| -2.70000000000022 | 0.987 | 0.024 | 0.001 |
| -2.696000000000219 | 0.989 | 0.024 | 0.001 |
| -2.692000000000219 | 0.991 | 0.024 | 0.001 |
| -2.688000000000219 | 0.993 | 0.024 | 0.001 |
| -2.684000000000219 | 0.995 | 0.024 | 0.001 |
| -2.680000000000219 | 0.997 | 0.024 | 0.001 |
| -2.676000000000219 | 0.999 | 0.024 | 0.001 |
| -2.672000000000219 | 1.001 | 0.025 | 0.001 |
| -2.668000000000219 | 1.003 | 0.025 | 0.001 |
| -2.664000000000219 | 1.005 | 0.025 | 0.001 |
| -2.660000000000219 | 1.007 | 0.025 | 0.001 |
| -2.656000000000219 | 1.009 | 0.025 | 0.001 |
| -2.652000000000219 | 1.011 | 0.025 | 0.001 |
| -2.648000000000219 | 1.013 | 0.025 | 0.001 |
| -2.644000000000219 | 1.015 | 0.026 | 0.001 |
| -2.640000000000219 | 1.017 | 0.026 | 0.001 |
| -2.636000000000219 | 1.019 | 0.026 | 0.001 |
| -2.632000000000219 | 1.021 | 0.026 | 0.001 |
| -2.628000000000219 | 1.023 | 0.026 | 0.001 |
| -2.624000000000219 | 1.025 | 0.026 | 0.001 |
| -2.620000000000219 | 1.027 | 0.026 | 0.001 |
| -2.616000000000219 | 1.029 | 0.027 | 0.001 |
| -2.612000000000219 | 1.031 | 0.027 | 0.001 |
| -2.608000000000219 | 1.033 | 0.027 | 0.001 |
| -2.604000000000219 | 1.035 | 0.027 | 0.001 |
| -2.600000000000219 | 1.037 | 0.027 | 0.001 |
| -2.596000000000219 | 1.039 | 0.027 | 0.001 |
| -2.592000000000219 | 1.041 | 0.027 | 0.001 |
| -2.588000000000219 | 1.043 | 0.028 | 0.001 |
| -2.584000000000219 | 1.045 | 0.028 | 0.001 |
| -2.580000000000219 | 1.047 | 0.028 | 0.001 |
| -2.576000000000219 | 1.049 | 0.028 | 0.001 |
| -2.572000000000219 | 1.051 | 0.028 | 0.001 |
| -2.568000000000219 | 1.053 | 0.028 | 0.001 |
| -2.564000000000219 | 1.055 | 0.029 | 0.001 |
| -2.560000000000219 | 1.057 | 0.029 | 0.001 |
| -2.556000000000219 | 1.059 | 0.029 | 0.001 |
| -2.552000000000219 | 1.061 | 0.029 | 0.001 |
| -2.548000000000219 | 1.063 | 0.029 | 0.001 |
| -2.544000000000219 | 1.065 | 0.029 | 0.001 |
| -2.540000000000219 | 1.067 | 0.03 | 0.001 |
| -2.536000000000219 | 1.069 | 0.03 | 0.001 |
| -2.532000000000219 | 1.071 | 0.03 | 0.001 |
| -2.528000000000219 | 1.073 | 0.03 | 0.001 |
| -2.524000000000219 | 1.075 | 0.03 | 0.001 |
| -2.520000000000219 | 1.077 | 0.03 | 0.001 |
| -2.516000000000219 | 1.079 | 0.03 | 0.001 |
| -2.512000000000219 | 1.081 | 0.031 | 0.001 |
| -2.508000000000219 | 1.084 | 0.031 | 0.001 |
| -2.504000000000219 | 1.086 | 0.031 | 0.001 |
| -2.500000000000219 | 1.088 | 0.031 | 0.002 |
| -2.496000000000219 | 1.09 | 0.031 | 0.002 |
| -2.492000000000219 | 1.092 | 0.032 | 0.002 |
| -2.488000000000219 | 1.094 | 0.032 | 0.002 |
| -2.484000000000219 | 1.096 | 0.032 | 0.002 |
| -2.480000000000219 | 1.098 | 0.032 | 0.002 |
| -2.476000000000219 | 1.1 | 0.032 | 0.002 |
| -2.472000000000219 | 1.102 | 0.032 | 0.002 |
| -2.468000000000219 | 1.104 | 0.033 | 0.002 |
| -2.464000000000219 | 1.106 | 0.033 | 0.002 |
| -2.460000000000219 | 1.108 | 0.033 | 0.002 |
| -2.456000000000219 | 1.11 | 0.033 | 0.002 |
| -2.452000000000219 | 1.112 | 0.033 | 0.002 |
| -2.448000000000219 | 1.114 | 0.033 | 0.002 |
| -2.444000000000219 | 1.117 | 0.034 | 0.002 |
| -2.440000000000219 | 1.119 | 0.034 | 0.002 |
| -2.436000000000219 | 1.121 | 0.034 | 0.002 |
| -2.432000000000219 | 1.123 | 0.034 | 0.002 |
| -2.428000000000219 | 1.125 | 0.034 | 0.002 |
| -2.424000000000219 | 1.127 | 0.035 | 0.002 |
| -2.420000000000219 | 1.129 | 0.035 | 0.002 |
| -2.416000000000219 | 1.131 | 0.035 | 0.002 |
| -2.412000000000219 | 1.133 | 0.035 | 0.002 |
| -2.408000000000219 | 1.135 | 0.035 | 0.002 |
| -2.404000000000219 | 1.137 | 0.035 | 0.002 |
| -2.400000000000219 | 1.139 | 0.036 | 0.002 |
| -2.396000000000219 | 1.142 | 0.036 | 0.002 |
| -2.392000000000219 | 1.144 | 0.036 | 0.002 |
| -2.388000000000219 | 1.146 | 0.036 | 0.002 |
| -2.384000000000219 | 1.148 | 0.036 | 0.002 |
| -2.380000000000219 | 1.15 | 0.037 | 0.002 |
| -2.376000000000219 | 1.152 | 0.037 | 0.002 |
| -2.372000000000219 | 1.154 | 0.037 | 0.002 |
| -2.368000000000219 | 1.156 | 0.037 | 0.002 |
| -2.364000000000219 | 1.158 | 0.037 | 0.002 |
| -2.360000000000219 | 1.16 | 0.038 | 0.002 |
| -2.356000000000219 | 1.162 | 0.038 | 0.002 |
| -2.352000000000219 | 1.165 | 0.038 | 0.002 |
| -2.348000000000219 | 1.167 | 0.038 | 0.002 |
| -2.344000000000219 | 1.169 | 0.038 | 0.002 |
| -2.340000000000219 | 1.171 | 0.039 | 0.002 |
| -2.336000000000219 | 1.173 | 0.039 | 0.002 |
| -2.332000000000219 | 1.175 | 0.039 | 0.002 |
| -2.328000000000219 | 1.177 | 0.039 | 0.002 |
| -2.324000000000219 | 1.179 | 0.039 | 0.002 |
| -2.320000000000219 | 1.181 | 0.04 | 0.002 |
| -2.316000000000219 | 1.184 | 0.04 | 0.002 |
| -2.312000000000219 | 1.186 | 0.04 | 0.002 |
| -2.308000000000219 | 1.188 | 0.04 | 0.002 |
| -2.304000000000219 | 1.19 | 0.04 | 0.002 |
| -2.300000000000219 | 1.192 | 0.041 | 0.002 |
| -2.296000000000219 | 1.194 | 0.041 | 0.002 |
| -2.292000000000219 | 1.196 | 0.041 | 0.002 |
| -2.288000000000219 | 1.198 | 0.041 | 0.002 |
| -2.284000000000219 | 1.201 | 0.042 | 0.002 |
| -2.280000000000219 | 1.203 | 0.042 | 0.002 |
| -2.276000000000219 | 1.205 | 0.042 | 0.002 |
| -2.272000000000219 | 1.207 | 0.042 | 0.003 |
| -2.268000000000219 | 1.209 | 0.042 | 0.003 |
| -2.264000000000219 | 1.211 | 0.043 | 0.003 |
| -2.260000000000219 | 1.213 | 0.043 | 0.003 |
| -2.256000000000219 | 1.215 | 0.043 | 0.003 |
| -2.252000000000219 | 1.218 | 0.043 | 0.003 |
| -2.248000000000219 | 1.22 | 0.044 | 0.003 |
| -2.244000000000219 | 1.222 | 0.044 | 0.003 |
| -2.240000000000219 | 1.224 | 0.044 | 0.003 |
| -2.236000000000219 | 1.226 | 0.044 | 0.003 |
| -2.232000000000219 | 1.228 | 0.044 | 0.003 |
| -2.228000000000219 | 1.23 | 0.045 | 0.003 |
| -2.224000000000219 | 1.233 | 0.045 | 0.003 |
| -2.220000000000219 | 1.235 | 0.045 | 0.003 |
| -2.216000000000219 | 1.237 | 0.045 | 0.003 |
| -2.212000000000219 | 1.239 | 0.046 | 0.003 |
| -2.208000000000219 | 1.241 | 0.046 | 0.003 |
| -2.204000000000219 | 1.243 | 0.046 | 0.003 |
| -2.200000000000219 | 1.245 | 0.046 | 0.003 |
| -2.196000000000219 | 1.248 | 0.047 | 0.003 |
| -2.192000000000219 | 1.25 | 0.047 | 0.003 |
| -2.188000000000219 | 1.252 | 0.047 | 0.003 |
| -2.184000000000219 | 1.254 | 0.047 | 0.003 |
| -2.180000000000219 | 1.256 | 0.047 | 0.003 |
| -2.176000000000219 | 1.258 | 0.048 | 0.003 |
| -2.172000000000219 | 1.26 | 0.048 | 0.003 |
| -2.168000000000219 | 1.263 | 0.048 | 0.003 |
| -2.164000000000219 | 1.265 | 0.048 | 0.003 |
| -2.160000000000219 | 1.267 | 0.049 | 0.003 |
| -2.156000000000219 | 1.269 | 0.049 | 0.003 |
| -2.152000000000219 | 1.271 | 0.049 | 0.003 |
| -2.148000000000219 | 1.273 | 0.049 | 0.003 |
| -2.144000000000219 | 1.276 | 0.05 | 0.003 |
| -2.140000000000219 | 1.278 | 0.05 | 0.003 |
| -2.136000000000219 | 1.28 | 0.05 | 0.003 |
| -2.132000000000219 | 1.282 | 0.05 | 0.003 |
| -2.128000000000219 | 1.284 | 0.051 | 0.003 |
| -2.124000000000219 | 1.286 | 0.051 | 0.004 |
| -2.120000000000219 | 1.288 | 0.051 | 0.004 |
| -2.116000000000219 | 1.291 | 0.052 | 0.004 |
| -2.112000000000219 | 1.293 | 0.052 | 0.004 |
| -2.108000000000219 | 1.295 | 0.052 | 0.004 |
| -2.104000000000219 | 1.297 | 0.052 | 0.004 |
| -2.100000000000219 | 1.299 | 0.053 | 0.004 |
| -2.096000000000219 | 1.301 | 0.053 | 0.004 |
| -2.092000000000219 | 1.304 | 0.053 | 0.004 |
| -2.088000000000219 | 1.306 | 0.053 | 0.004 |
| -2.084000000000219 | 1.308 | 0.054 | 0.004 |
| -2.080000000000219 | 1.31 | 0.054 | 0.004 |
| -2.076000000000219 | 1.312 | 0.054 | 0.004 |
| -2.072000000000219 | 1.314 | 0.054 | 0.004 |
| -2.068000000000219 | 1.317 | 0.055 | 0.004 |
| -2.064000000000219 | 1.319 | 0.055 | 0.004 |
| -2.060000000000219 | 1.321 | 0.055 | 0.004 |
| -2.056000000000219 | 1.323 | 0.056 | 0.004 |
| -2.052000000000219 | 1.325 | 0.056 | 0.004 |
| -2.048000000000219 | 1.327 | 0.056 | 0.004 |
| -2.044000000000219 | 1.33 | 0.056 | 0.004 |
| -2.040000000000219 | 1.332 | 0.057 | 0.004 |
| -2.036000000000219 | 1.334 | 0.057 | 0.004 |
| -2.032000000000219 | 1.336 | 0.057 | 0.004 |
| -2.028000000000219 | 1.338 | 0.058 | 0.004 |
| -2.024000000000219 | 1.34 | 0.058 | 0.004 |
| -2.020000000000219 | 1.343 | 0.058 | 0.004 |
| -2.016000000000219 | 1.345 | 0.058 | 0.004 |
| -2.012000000000219 | 1.347 | 0.059 | 0.004 |
| -2.008000000000218 | 1.349 | 0.059 | 0.005 |
| -2.004000000000218 | 1.351 | 0.059 | 0.005 |
| -2.000000000000218 | 1.353 | 0.06 | 0.005 |
| -1.996000000000218 | 1.356 | 0.06 | 0.005 |
| -1.992000000000218 | 1.358 | 0.06 | 0.005 |
| -1.988000000000218 | 1.36 | 0.06 | 0.005 |
| -1.984000000000218 | 1.362 | 0.061 | 0.005 |
| -1.980000000000218 | 1.364 | 0.061 | 0.005 |
| -1.976000000000218 | 1.366 | 0.061 | 0.005 |
| -1.972000000000218 | 1.369 | 0.062 | 0.005 |
| -1.968000000000218 | 1.371 | 0.062 | 0.005 |
| -1.964000000000218 | 1.373 | 0.062 | 0.005 |
| -1.960000000000218 | 1.375 | 0.063 | 0.005 |
| -1.956000000000218 | 1.377 | 0.063 | 0.005 |
| -1.952000000000218 | 1.379 | 0.063 | 0.005 |
| -1.948000000000218 | 1.381 | 0.063 | 0.005 |
| -1.944000000000218 | 1.384 | 0.064 | 0.005 |
| -1.940000000000218 | 1.386 | 0.064 | 0.005 |
| -1.936000000000218 | 1.388 | 0.064 | 0.005 |
| -1.932000000000218 | 1.39 | 0.065 | 0.005 |
| -1.928000000000218 | 1.392 | 0.065 | 0.005 |
| -1.924000000000218 | 1.394 | 0.065 | 0.005 |
| -1.920000000000218 | 1.397 | 0.066 | 0.005 |
| -1.916000000000218 | 1.399 | 0.066 | 0.005 |
| -1.912000000000218 | 1.401 | 0.066 | 0.006 |
| -1.908000000000218 | 1.403 | 0.067 | 0.006 |
| -1.904000000000218 | 1.405 | 0.067 | 0.006 |
| -1.900000000000218 | 1.407 | 0.067 | 0.006 |
| -1.896000000000218 | 1.41 | 0.068 | 0.006 |
| -1.892000000000218 | 1.412 | 0.068 | 0.006 |
| -1.888000000000218 | 1.414 | 0.068 | 0.006 |
| -1.884000000000218 | 1.416 | 0.069 | 0.006 |
| -1.880000000000218 | 1.418 | 0.069 | 0.006 |
| -1.876000000000218 | 1.42 | 0.069 | 0.006 |
| -1.872000000000218 | 1.423 | 0.07 | 0.006 |
| -1.868000000000218 | 1.425 | 0.07 | 0.006 |
| -1.864000000000218 | 1.427 | 0.07 | 0.006 |
| -1.860000000000218 | 1.429 | 0.071 | 0.006 |
| -1.856000000000218 | 1.431 | 0.071 | 0.006 |
| -1.852000000000218 | 1.433 | 0.071 | 0.006 |
| -1.848000000000218 | 1.435 | 0.072 | 0.006 |
| -1.844000000000218 | 1.438 | 0.072 | 0.006 |
| -1.840000000000218 | 1.44 | 0.072 | 0.006 |
| -1.836000000000218 | 1.442 | 0.073 | 0.007 |
| -1.832000000000218 | 1.444 | 0.073 | 0.007 |
| -1.828000000000218 | 1.446 | 0.073 | 0.007 |
| -1.824000000000218 | 1.448 | 0.074 | 0.007 |
| -1.820000000000218 | 1.451 | 0.074 | 0.007 |
| -1.816000000000218 | 1.453 | 0.074 | 0.007 |
| -1.812000000000218 | 1.455 | 0.075 | 0.007 |
| -1.808000000000218 | 1.457 | 0.075 | 0.007 |
| -1.804000000000218 | 1.459 | 0.075 | 0.007 |
| -1.800000000000218 | 1.461 | 0.076 | 0.007 |
| -1.796000000000218 | 1.463 | 0.076 | 0.007 |
| -1.792000000000218 | 1.466 | 0.076 | 0.007 |
| -1.788000000000218 | 1.468 | 0.077 | 0.007 |
| -1.784000000000218 | 1.47 | 0.077 | 0.007 |
| -1.780000000000218 | 1.472 | 0.077 | 0.007 |
| -1.776000000000218 | 1.474 | 0.078 | 0.007 |
| -1.772000000000218 | 1.476 | 0.078 | 0.007 |
| -1.768000000000218 | 1.478 | 0.079 | 0.008 |
| -1.764000000000218 | 1.48 | 0.079 | 0.008 |
| -1.760000000000218 | 1.483 | 0.079 | 0.008 |
| -1.756000000000218 | 1.485 | 0.08 | 0.008 |
| -1.752000000000218 | 1.487 | 0.08 | 0.008 |
| -1.748000000000218 | 1.489 | 0.08 | 0.008 |
| -1.744000000000218 | 1.491 | 0.081 | 0.008 |
| -1.740000000000218 | 1.493 | 0.081 | 0.008 |
| -1.736000000000218 | 1.495 | 0.082 | 0.008 |
| -1.732000000000218 | 1.498 | 0.082 | 0.008 |
| -1.728000000000218 | 1.5 | 0.082 | 0.008 |
| -1.724000000000218 | 1.502 | 0.083 | 0.008 |
| -1.720000000000218 | 1.504 | 0.083 | 0.008 |
| -1.716000000000218 | 1.506 | 0.083 | 0.008 |
| -1.712000000000218 | 1.508 | 0.084 | 0.008 |
| -1.708000000000218 | 1.51 | 0.084 | 0.008 |
| -1.704000000000218 | 1.512 | 0.085 | 0.009 |
| -1.700000000000218 | 1.514 | 0.085 | 0.009 |
| -1.696000000000218 | 1.517 | 0.085 | 0.009 |
| -1.692000000000218 | 1.519 | 0.086 | 0.009 |
| -1.688000000000218 | 1.521 | 0.086 | 0.009 |
| -1.684000000000218 | 1.523 | 0.086 | 0.009 |
| -1.680000000000218 | 1.525 | 0.087 | 0.009 |
| -1.676000000000218 | 1.527 | 0.087 | 0.009 |
| -1.672000000000218 | 1.529 | 0.088 | 0.009 |
| -1.668000000000218 | 1.531 | 0.088 | 0.009 |
| -1.664000000000218 | 1.533 | 0.088 | 0.009 |
| -1.660000000000218 | 1.535 | 0.089 | 0.009 |
| -1.656000000000218 | 1.538 | 0.089 | 0.009 |
| -1.652000000000218 | 1.54 | 0.09 | 0.01 |
| -1.648000000000218 | 1.542 | 0.09 | 0.01 |
| -1.644000000000218 | 1.544 | 0.09 | 0.01 |
| -1.640000000000218 | 1.546 | 0.091 | 0.01 |
| -1.636000000000218 | 1.548 | 0.091 | 0.01 |
| -1.632000000000218 | 1.55 | 0.092 | 0.01 |
| -1.628000000000218 | 1.552 | 0.092 | 0.01 |
| -1.624000000000218 | 1.554 | 0.092 | 0.01 |
| -1.620000000000218 | 1.556 | 0.093 | 0.01 |
| -1.616000000000218 | 1.558 | 0.093 | 0.01 |
| -1.612000000000218 | 1.561 | 0.094 | 0.01 |
| -1.608000000000218 | 1.563 | 0.094 | 0.01 |
| -1.604000000000218 | 1.565 | 0.095 | 0.01 |
| -1.600000000000218 | 1.567 | 0.095 | 0.011 |
| -1.596000000000218 | 1.569 | 0.095 | 0.011 |
| -1.592000000000218 | 1.571 | 0.096 | 0.011 |
| -1.588000000000218 | 1.573 | 0.096 | 0.011 |
| -1.584000000000218 | 1.575 | 0.097 | 0.011 |
| -1.580000000000218 | 1.577 | 0.097 | 0.011 |
| -1.576000000000218 | 1.579 | 0.098 | 0.011 |
| -1.572000000000218 | 1.581 | 0.098 | 0.011 |
| -1.568000000000218 | 1.583 | 0.098 | 0.011 |
| -1.564000000000218 | 1.585 | 0.099 | 0.011 |
| -1.560000000000218 | 1.587 | 0.099 | 0.011 |
| -1.556000000000218 | 1.589 | 0.1 | 0.012 |
| -1.552000000000218 | 1.591 | 0.1 | 0.012 |
| -1.548000000000218 | 1.593 | 0.101 | 0.012 |
| -1.544000000000218 | 1.595 | 0.101 | 0.012 |
| -1.540000000000218 | 1.597 | 0.101 | 0.012 |
| -1.536000000000218 | 1.6 | 0.102 | 0.012 |
| -1.532000000000218 | 1.602 | 0.102 | 0.012 |
| -1.528000000000218 | 1.604 | 0.103 | 0.012 |
| -1.524000000000218 | 1.606 | 0.103 | 0.012 |
| -1.520000000000218 | 1.608 | 0.104 | 0.012 |
| -1.516000000000218 | 1.61 | 0.104 | 0.012 |
| -1.512000000000218 | 1.612 | 0.104 | 0.013 |
| -1.508000000000218 | 1.614 | 0.105 | 0.013 |
| -1.504000000000218 | 1.616 | 0.105 | 0.013 |
| -1.500000000000218 | 1.618 | 0.106 | 0.013 |
| -1.496000000000218 | 1.62 | 0.106 | 0.013 |
| -1.492000000000218 | 1.622 | 0.107 | 0.013 |
| -1.488000000000218 | 1.624 | 0.107 | 0.013 |
| -1.484000000000218 | 1.626 | 0.108 | 0.013 |
| -1.480000000000218 | 1.628 | 0.108 | 0.013 |
| -1.476000000000218 | 1.63 | 0.109 | 0.013 |
| -1.472000000000218 | 1.632 | 0.109 | 0.014 |
| -1.468000000000218 | 1.634 | 0.109 | 0.014 |
| -1.464000000000218 | 1.636 | 0.11 | 0.014 |
| -1.460000000000218 | 1.638 | 0.11 | 0.014 |
| -1.456000000000218 | 1.64 | 0.111 | 0.014 |
| -1.452000000000218 | 1.642 | 0.111 | 0.014 |
| -1.448000000000218 | 1.644 | 0.112 | 0.014 |
| -1.444000000000218 | 1.646 | 0.112 | 0.014 |
| -1.440000000000218 | 1.648 | 0.113 | 0.014 |
| -1.436000000000218 | 1.649 | 0.113 | 0.015 |
| -1.432000000000218 | 1.651 | 0.114 | 0.015 |
| -1.428000000000218 | 1.653 | 0.114 | 0.015 |
| -1.424000000000218 | 1.655 | 0.115 | 0.015 |
| -1.420000000000218 | 1.657 | 0.115 | 0.015 |
| -1.416000000000218 | 1.659 | 0.115 | 0.015 |
| -1.412000000000218 | 1.661 | 0.116 | 0.015 |
| -1.408000000000218 | 1.663 | 0.116 | 0.015 |
| -1.404000000000218 | 1.665 | 0.117 | 0.015 |
| -1.400000000000218 | 1.667 | 0.117 | 0.016 |
| -1.396000000000218 | 1.669 | 0.118 | 0.016 |
| -1.392000000000218 | 1.671 | 0.118 | 0.016 |
| -1.388000000000218 | 1.673 | 0.119 | 0.016 |
| -1.384000000000218 | 1.675 | 0.119 | 0.016 |
| -1.380000000000218 | 1.677 | 0.12 | 0.016 |
| -1.376000000000218 | 1.679 | 0.12 | 0.016 |
| -1.372000000000218 | 1.68 | 0.121 | 0.016 |
| -1.368000000000218 | 1.682 | 0.121 | 0.017 |
| -1.364000000000218 | 1.684 | 0.122 | 0.017 |
| -1.360000000000218 | 1.686 | 0.122 | 0.017 |
| -1.356000000000218 | 1.688 | 0.123 | 0.017 |
| -1.352000000000218 | 1.69 | 0.123 | 0.017 |
| -1.348000000000218 | 1.692 | 0.124 | 0.017 |
| -1.344000000000218 | 1.694 | 0.124 | 0.017 |
| -1.340000000000218 | 1.696 | 0.125 | 0.017 |
| -1.336000000000218 | 1.697 | 0.125 | 0.018 |
| -1.332000000000218 | 1.699 | 0.126 | 0.018 |
| -1.328000000000218 | 1.701 | 0.126 | 0.018 |
| -1.324000000000218 | 1.703 | 0.127 | 0.018 |
| -1.320000000000218 | 1.705 | 0.127 | 0.018 |
| -1.316000000000218 | 1.707 | 0.128 | 0.018 |
| -1.312000000000218 | 1.709 | 0.128 | 0.018 |
| -1.308000000000218 | 1.711 | 0.129 | 0.018 |
| -1.304000000000218 | 1.712 | 0.129 | 0.019 |
| -1.300000000000218 | 1.714 | 0.13 | 0.019 |
| -1.296000000000218 | 1.716 | 0.13 | 0.019 |
| -1.292000000000218 | 1.718 | 0.131 | 0.019 |
| -1.288000000000218 | 1.72 | 0.131 | 0.019 |
| -1.284000000000218 | 1.722 | 0.132 | 0.019 |
| -1.280000000000218 | 1.723 | 0.132 | 0.019 |
| -1.276000000000218 | 1.725 | 0.133 | 0.02 |
| -1.272000000000218 | 1.727 | 0.133 | 0.02 |
| -1.268000000000218 | 1.729 | 0.134 | 0.02 |
| -1.264000000000218 | 1.731 | 0.134 | 0.02 |
| -1.260000000000218 | 1.732 | 0.135 | 0.02 |
| -1.256000000000218 | 1.734 | 0.135 | 0.02 |
| -1.252000000000218 | 1.736 | 0.136 | 0.02 |
| -1.248000000000218 | 1.738 | 0.136 | 0.021 |
| -1.244000000000218 | 1.74 | 0.137 | 0.021 |
| -1.240000000000218 | 1.741 | 0.137 | 0.021 |
| -1.236000000000218 | 1.743 | 0.138 | 0.021 |
| -1.232000000000218 | 1.745 | 0.138 | 0.021 |
| -1.228000000000218 | 1.747 | 0.139 | 0.021 |
| -1.224000000000218 | 1.748 | 0.139 | 0.021 |
| -1.220000000000218 | 1.75 | 0.14 | 0.022 |
| -1.216000000000218 | 1.752 | 0.14 | 0.022 |
| -1.212000000000218 | 1.754 | 0.141 | 0.022 |
| -1.208000000000218 | 1.755 | 0.141 | 0.022 |
| -1.204000000000218 | 1.757 | 0.142 | 0.022 |
| -1.200000000000218 | 1.759 | 0.142 | 0.022 |
| -1.196000000000218 | 1.761 | 0.143 | 0.023 |
| -1.192000000000218 | 1.762 | 0.143 | 0.023 |
| -1.188000000000218 | 1.764 | 0.144 | 0.023 |
| -1.184000000000218 | 1.766 | 0.145 | 0.023 |
| -1.180000000000218 | 1.768 | 0.145 | 0.023 |
| -1.176000000000218 | 1.769 | 0.146 | 0.023 |
| -1.172000000000218 | 1.771 | 0.146 | 0.024 |
| -1.168000000000218 | 1.773 | 0.147 | 0.024 |
| -1.164000000000218 | 1.774 | 0.147 | 0.024 |
| -1.160000000000218 | 1.776 | 0.148 | 0.024 |
| -1.156000000000218 | 1.778 | 0.148 | 0.024 |
| -1.152000000000218 | 1.779 | 0.149 | 0.024 |
| -1.148000000000218 | 1.781 | 0.149 | 0.025 |
| -1.144000000000218 | 1.783 | 0.15 | 0.025 |
| -1.140000000000218 | 1.784 | 0.15 | 0.025 |
| -1.136000000000218 | 1.786 | 0.151 | 0.025 |
| -1.132000000000218 | 1.788 | 0.151 | 0.025 |
| -1.128000000000218 | 1.789 | 0.152 | 0.025 |
| -1.124000000000218 | 1.791 | 0.152 | 0.026 |
| -1.120000000000218 | 1.793 | 0.153 | 0.026 |
| -1.116000000000218 | 1.794 | 0.154 | 0.026 |
| -1.112000000000218 | 1.796 | 0.154 | 0.026 |
| -1.108000000000218 | 1.798 | 0.155 | 0.026 |
| -1.104000000000218 | 1.799 | 0.155 | 0.026 |
| -1.100000000000218 | 1.801 | 0.156 | 0.027 |
| -1.096000000000218 | 1.802 | 0.156 | 0.027 |
| -1.092000000000218 | 1.804 | 0.157 | 0.027 |
| -1.088000000000218 | 1.806 | 0.157 | 0.027 |
| -1.084000000000218 | 1.807 | 0.158 | 0.027 |
| -1.080000000000218 | 1.809 | 0.158 | 0.028 |
| -1.076000000000218 | 1.81 | 0.159 | 0.028 |
| -1.072000000000218 | 1.812 | 0.159 | 0.028 |
| -1.068000000000218 | 1.814 | 0.16 | 0.028 |
| -1.064000000000218 | 1.815 | 0.161 | 0.028 |
| -1.060000000000218 | 1.817 | 0.161 | 0.028 |
| -1.056000000000218 | 1.818 | 0.162 | 0.029 |
| -1.052000000000218 | 1.82 | 0.162 | 0.029 |
| -1.048000000000218 | 1.821 | 0.163 | 0.029 |
| -1.044000000000218 | 1.823 | 0.163 | 0.029 |
| -1.040000000000218 | 1.824 | 0.164 | 0.029 |
| -1.036000000000218 | 1.826 | 0.164 | 0.03 |
| -1.032000000000218 | 1.827 | 0.165 | 0.03 |
| -1.028000000000218 | 1.829 | 0.165 | 0.03 |
| -1.024000000000218 | 1.83 | 0.166 | 0.03 |
| -1.020000000000218 | 1.832 | 0.166 | 0.03 |
| -1.016000000000218 | 1.833 | 0.167 | 0.031 |
| -1.012000000000218 | 1.835 | 0.168 | 0.031 |
| -1.008000000000218 | 1.836 | 0.168 | 0.031 |
| -1.004000000000218 | 1.838 | 0.169 | 0.031 |
| -1.000000000000218 | 1.839 | 0.169 | 0.031 |
| -0.996000000000218 | 1.841 | 0.17 | 0.032 |
| -0.992000000000218 | 1.842 | 0.17 | 0.032 |
| -0.988000000000218 | 1.844 | 0.171 | 0.032 |
| -0.984000000000218 | 1.845 | 0.171 | 0.032 |
| -0.980000000000218 | 1.847 | 0.172 | 0.032 |
| -0.976000000000218 | 1.848 | 0.172 | 0.033 |
| -0.972000000000218 | 1.85 | 0.173 | 0.033 |
| -0.968000000000218 | 1.851 | 0.173 | 0.033 |
| -0.964000000000218 | 1.852 | 0.174 | 0.033 |
| -0.960000000000218 | 1.854 | 0.175 | 0.033 |
| -0.956000000000218 | 1.855 | 0.175 | 0.034 |
| -0.952000000000218 | 1.857 | 0.176 | 0.034 |
| -0.948000000000218 | 1.858 | 0.176 | 0.034 |
| -0.944000000000218 | 1.859 | 0.177 | 0.034 |
| -0.940000000000218 | 1.861 | 0.177 | 0.034 |
| -0.936000000000218 | 1.862 | 0.178 | 0.035 |
| -0.932000000000218 | 1.864 | 0.178 | 0.035 |
| -0.928000000000218 | 1.865 | 0.179 | 0.035 |
| -0.924000000000218 | 1.866 | 0.179 | 0.035 |
| -0.920000000000218 | 1.868 | 0.18 | 0.035 |
| -0.916000000000218 | 1.869 | 0.181 | 0.036 |
| -0.912000000000218 | 1.87 | 0.181 | 0.036 |
| -0.908000000000217 | 1.872 | 0.182 | 0.036 |
| -0.904000000000217 | 1.873 | 0.182 | 0.036 |
| -0.900000000000217 | 1.874 | 0.183 | 0.037 |
| -0.896000000000217 | 1.876 | 0.183 | 0.037 |
| -0.892000000000217 | 1.877 | 0.184 | 0.037 |
| -0.888000000000217 | 1.878 | 0.184 | 0.037 |
| -0.884000000000217 | 1.88 | 0.185 | 0.037 |
| -0.880000000000217 | 1.881 | 0.185 | 0.038 |
| -0.876000000000217 | 1.882 | 0.186 | 0.038 |
| -0.872000000000217 | 1.883 | 0.186 | 0.038 |
| -0.868000000000217 | 1.885 | 0.187 | 0.038 |
| -0.864000000000217 | 1.886 | 0.187 | 0.039 |
| -0.860000000000217 | 1.887 | 0.188 | 0.039 |
| -0.856000000000217 | 1.888 | 0.189 | 0.039 |
| -0.852000000000217 | 1.89 | 0.189 | 0.039 |
| -0.848000000000217 | 1.891 | 0.19 | 0.039 |
| -0.844000000000217 | 1.892 | 0.19 | 0.04 |
| -0.840000000000217 | 1.893 | 0.191 | 0.04 |
| -0.836000000000217 | 1.895 | 0.191 | 0.04 |
| -0.832000000000217 | 1.896 | 0.192 | 0.04 |
| -0.828000000000217 | 1.897 | 0.192 | 0.041 |
| -0.824000000000217 | 1.898 | 0.193 | 0.041 |
| -0.820000000000217 | 1.899 | 0.193 | 0.041 |
| -0.816000000000217 | 1.9 | 0.194 | 0.041 |
| -0.812000000000217 | 1.902 | 0.194 | 0.042 |
| -0.808000000000217 | 1.903 | 0.195 | 0.042 |
| -0.804000000000217 | 1.904 | 0.195 | 0.042 |
| -0.800000000000217 | 1.905 | 0.196 | 0.042 |
| -0.796000000000217 | 1.906 | 0.196 | 0.042 |
| -0.792000000000217 | 1.907 | 0.197 | 0.043 |
| -0.788000000000217 | 1.909 | 0.197 | 0.043 |
| -0.784000000000217 | 1.91 | 0.198 | 0.043 |
| -0.780000000000217 | 1.911 | 0.198 | 0.043 |
| -0.776000000000217 | 1.912 | 0.199 | 0.044 |
| -0.772000000000217 | 1.913 | 0.199 | 0.044 |
| -0.768000000000217 | 1.914 | 0.2 | 0.044 |
| -0.764000000000217 | 1.915 | 0.2 | 0.044 |
| -0.760000000000217 | 1.916 | 0.201 | 0.045 |
| -0.756000000000217 | 1.917 | 0.201 | 0.045 |
| -0.752000000000217 | 1.918 | 0.202 | 0.045 |
| -0.748000000000217 | 1.92 | 0.202 | 0.045 |
| -0.744000000000217 | 1.921 | 0.203 | 0.045 |
| -0.740000000000217 | 1.922 | 0.203 | 0.046 |
| -0.736000000000217 | 1.923 | 0.204 | 0.046 |
| -0.732000000000217 | 1.924 | 0.204 | 0.046 |
| -0.728000000000217 | 1.925 | 0.205 | 0.046 |
| -0.724000000000217 | 1.926 | 0.205 | 0.047 |
| -0.720000000000217 | 1.927 | 0.206 | 0.047 |
| -0.716000000000217 | 1.928 | 0.206 | 0.047 |
| -0.712000000000217 | 1.929 | 0.207 | 0.047 |
| -0.708000000000217 | 1.93 | 0.207 | 0.048 |
| -0.704000000000217 | 1.931 | 0.208 | 0.048 |
| -0.700000000000217 | 1.932 | 0.208 | 0.048 |
| -0.696000000000217 | 1.933 | 0.209 | 0.048 |
| -0.692000000000217 | 1.934 | 0.209 | 0.049 |
| -0.688000000000217 | 1.935 | 0.21 | 0.049 |
| -0.684000000000217 | 1.936 | 0.21 | 0.049 |
| -0.680000000000217 | 1.936 | 0.211 | 0.049 |
| -0.676000000000217 | 1.937 | 0.211 | 0.05 |
| -0.672000000000217 | 1.938 | 0.212 | 0.05 |
| -0.668000000000217 | 1.939 | 0.212 | 0.05 |
| -0.664000000000217 | 1.94 | 0.213 | 0.05 |
| -0.660000000000217 | 1.941 | 0.213 | 0.051 |
| -0.656000000000217 | 1.942 | 0.214 | 0.051 |
| -0.652000000000217 | 1.943 | 0.214 | 0.051 |
| -0.648000000000217 | 1.944 | 0.215 | 0.051 |
| -0.644000000000217 | 1.945 | 0.215 | 0.051 |
| -0.640000000000217 | 1.945 | 0.215 | 0.052 |
| -0.636000000000217 | 1.946 | 0.216 | 0.052 |
| -0.632000000000217 | 1.947 | 0.216 | 0.052 |
| -0.628000000000217 | 1.948 | 0.217 | 0.052 |
| -0.624000000000217 | 1.949 | 0.217 | 0.053 |
| -0.620000000000217 | 1.95 | 0.218 | 0.053 |
| -0.616000000000217 | 1.951 | 0.218 | 0.053 |
| -0.612000000000217 | 1.951 | 0.219 | 0.053 |
| -0.608000000000217 | 1.952 | 0.219 | 0.054 |
| -0.604000000000217 | 1.953 | 0.219 | 0.054 |
| -0.600000000000217 | 1.954 | 0.22 | 0.054 |
| -0.596000000000217 | 1.955 | 0.22 | 0.054 |
| -0.592000000000217 | 1.955 | 0.221 | 0.055 |
| -0.588000000000217 | 1.956 | 0.221 | 0.055 |
| -0.584000000000217 | 1.957 | 0.222 | 0.055 |
| -0.580000000000217 | 1.958 | 0.222 | 0.055 |
| -0.576000000000217 | 1.958 | 0.222 | 0.056 |
| -0.572000000000217 | 1.959 | 0.223 | 0.056 |
| -0.568000000000217 | 1.96 | 0.223 | 0.056 |
| -0.564000000000217 | 1.961 | 0.224 | 0.056 |
| -0.560000000000217 | 1.961 | 0.224 | 0.056 |
| -0.556000000000217 | 1.962 | 0.224 | 0.057 |
| -0.552000000000217 | 1.963 | 0.225 | 0.057 |
| -0.548000000000217 | 1.963 | 0.225 | 0.057 |
| -0.544000000000217 | 1.964 | 0.226 | 0.057 |
| -0.540000000000217 | 1.965 | 0.226 | 0.058 |
| -0.536000000000217 | 1.965 | 0.226 | 0.058 |
| -0.532000000000217 | 1.966 | 0.227 | 0.058 |
| -0.528000000000217 | 1.967 | 0.227 | 0.058 |
| -0.524000000000217 | 1.967 | 0.228 | 0.059 |
| -0.520000000000217 | 1.968 | 0.228 | 0.059 |
| -0.516000000000217 | 1.969 | 0.228 | 0.059 |
| -0.512000000000217 | 1.969 | 0.229 | 0.059 |
| -0.508000000000217 | 1.97 | 0.229 | 0.059 |
| -0.504000000000217 | 1.971 | 0.23 | 0.06 |
| -0.500000000000217 | 1.971 | 0.23 | 0.06 |
| -0.496000000000217 | 1.972 | 0.23 | 0.06 |
| -0.492000000000217 | 1.972 | 0.231 | 0.06 |
| -0.488000000000217 | 1.973 | 0.231 | 0.061 |
| -0.484000000000217 | 1.974 | 0.231 | 0.061 |
| -0.480000000000217 | 1.974 | 0.232 | 0.061 |
| -0.476000000000217 | 1.975 | 0.232 | 0.061 |
| -0.472000000000217 | 1.975 | 0.232 | 0.061 |
| -0.468000000000217 | 1.976 | 0.233 | 0.062 |
| -0.464000000000217 | 1.976 | 0.233 | 0.062 |
| -0.460000000000217 | 1.977 | 0.233 | 0.062 |
| -0.456000000000217 | 1.977 | 0.234 | 0.062 |
| -0.452000000000217 | 1.978 | 0.234 | 0.063 |
| -0.448000000000217 | 1.978 | 0.234 | 0.063 |
| -0.444000000000217 | 1.979 | 0.235 | 0.063 |
| -0.440000000000217 | 1.98 | 0.235 | 0.063 |
| -0.436000000000217 | 1.98 | 0.235 | 0.063 |
| -0.432000000000217 | 1.98 | 0.236 | 0.064 |
| -0.428000000000217 | 1.981 | 0.236 | 0.064 |
| -0.424000000000217 | 1.981 | 0.236 | 0.064 |
| -0.420000000000217 | 1.982 | 0.237 | 0.064 |
| -0.416000000000217 | 1.982 | 0.237 | 0.064 |
| -0.412000000000217 | 1.983 | 0.237 | 0.065 |
| -0.408000000000217 | 1.983 | 0.238 | 0.065 |
| -0.404000000000217 | 1.984 | 0.238 | 0.065 |
| -0.400000000000217 | 1.984 | 0.238 | 0.065 |
| -0.396000000000217 | 1.985 | 0.238 | 0.065 |
| -0.392000000000217 | 1.985 | 0.239 | 0.066 |
| -0.388000000000217 | 1.985 | 0.239 | 0.066 |
| -0.384000000000217 | 1.986 | 0.239 | 0.066 |
| -0.380000000000217 | 1.986 | 0.24 | 0.066 |
| -0.376000000000217 | 1.987 | 0.24 | 0.066 |
| -0.372000000000217 | 1.987 | 0.24 | 0.066 |
| -0.368000000000217 | 1.987 | 0.24 | 0.067 |
| -0.364000000000217 | 1.988 | 0.241 | 0.067 |
| -0.360000000000217 | 1.988 | 0.241 | 0.067 |
| -0.356000000000217 | 1.988 | 0.241 | 0.067 |
| -0.352000000000217 | 1.989 | 0.241 | 0.067 |
| -0.348000000000217 | 1.989 | 0.242 | 0.068 |
| -0.344000000000217 | 1.989 | 0.242 | 0.068 |
| -0.340000000000217 | 1.99 | 0.242 | 0.068 |
| -0.336000000000217 | 1.99 | 0.242 | 0.068 |
| -0.332000000000217 | 1.99 | 0.243 | 0.068 |
| -0.328000000000217 | 1.991 | 0.243 | 0.068 |
| -0.324000000000217 | 1.991 | 0.243 | 0.069 |
| -0.320000000000217 | 1.991 | 0.243 | 0.069 |
| -0.316000000000217 | 1.992 | 0.243 | 0.069 |
| -0.312000000000217 | 1.992 | 0.244 | 0.069 |
| -0.308000000000217 | 1.992 | 0.244 | 0.069 |
| -0.304000000000217 | 1.993 | 0.244 | 0.069 |
| -0.300000000000217 | 1.993 | 0.244 | 0.069 |
| -0.296000000000217 | 1.993 | 0.244 | 0.07 |
| -0.292000000000217 | 1.993 | 0.245 | 0.07 |
| -0.288000000000217 | 1.994 | 0.245 | 0.07 |
| -0.284000000000217 | 1.994 | 0.245 | 0.07 |
| -0.280000000000217 | 1.994 | 0.245 | 0.07 |
| -0.276000000000217 | 1.994 | 0.245 | 0.07 |
| -0.272000000000217 | 1.995 | 0.246 | 0.07 |
| -0.268000000000217 | 1.995 | 0.246 | 0.071 |
| -0.264000000000217 | 1.995 | 0.246 | 0.071 |
| -0.260000000000217 | 1.995 | 0.246 | 0.071 |
| -0.256000000000217 | 1.995 | 0.246 | 0.071 |
| -0.252000000000217 | 1.996 | 0.246 | 0.071 |
| -0.248000000000217 | 1.996 | 0.246 | 0.071 |
| -0.244000000000217 | 1.996 | 0.247 | 0.071 |
| -0.240000000000217 | 1.996 | 0.247 | 0.071 |
| -0.236000000000217 | 1.996 | 0.247 | 0.071 |
| -0.232000000000217 | 1.996 | 0.247 | 0.072 |
| -0.228000000000217 | 1.997 | 0.247 | 0.072 |
| -0.224000000000217 | 1.997 | 0.247 | 0.072 |
| -0.220000000000217 | 1.997 | 0.247 | 0.072 |
| -0.216000000000217 | 1.997 | 0.248 | 0.072 |
| -0.212000000000217 | 1.997 | 0.248 | 0.072 |
| -0.208000000000217 | 1.997 | 0.248 | 0.072 |
| -0.204000000000217 | 1.998 | 0.248 | 0.072 |
| -0.200000000000217 | 1.998 | 0.248 | 0.072 |
| -0.196000000000217 | 1.998 | 0.248 | 0.072 |
| -0.192000000000217 | 1.998 | 0.248 | 0.073 |
| -0.188000000000217 | 1.998 | 0.248 | 0.073 |
| -0.184000000000217 | 1.998 | 0.248 | 0.073 |
| -0.180000000000217 | 1.998 | 0.249 | 0.073 |
| -0.176000000000217 | 1.998 | 0.249 | 0.073 |
| -0.172000000000217 | 1.999 | 0.249 | 0.073 |
| -0.168000000000217 | 1.999 | 0.249 | 0.073 |
| -0.164000000000217 | 1.999 | 0.249 | 0.073 |
| -0.160000000000217 | 1.999 | 0.249 | 0.073 |
| -0.156000000000217 | 1.999 | 0.249 | 0.073 |
| -0.152000000000217 | 1.999 | 0.249 | 0.073 |
| -0.148000000000217 | 1.999 | 0.249 | 0.073 |
| -0.144000000000217 | 1.999 | 0.249 | 0.073 |
| -0.140000000000217 | 1.999 | 0.249 | 0.073 |
| -0.136000000000217 | 1.999 | 0.249 | 0.073 |
| -0.132000000000217 | 1.999 | 0.249 | 0.074 |
| -0.128000000000217 | 1.999 | 0.249 | 0.074 |
| -0.124000000000217 | 1.999 | 0.249 | 0.074 |
| -0.120000000000217 | 1.999 | 0.25 | 0.074 |
| -0.116000000000217 | 2 | 0.25 | 0.074 |
| -0.112000000000217 | 2 | 0.25 | 0.074 |
| -0.108000000000217 | 2 | 0.25 | 0.074 |
| -0.104000000000217 | 2 | 0.25 | 0.074 |
| -0.100000000000217 | 2 | 0.25 | 0.074 |
| -0.0960000000002168 | 2 | 0.25 | 0.074 |
| -0.0920000000002168 | 2 | 0.25 | 0.074 |
| -0.0880000000002168 | 2 | 0.25 | 0.074 |
| -0.0840000000002168 | 2 | 0.25 | 0.074 |
| -0.0800000000002168 | 2 | 0.25 | 0.074 |
| -0.0760000000002168 | 2 | 0.25 | 0.074 |
| -0.0720000000002168 | 2 | 0.25 | 0.074 |
| -0.0680000000002168 | 2 | 0.25 | 0.074 |
| -0.0640000000002168 | 2 | 0.25 | 0.074 |
| -0.0600000000002168 | 2 | 0.25 | 0.074 |
| -0.0560000000002168 | 2 | 0.25 | 0.074 |
| -0.0520000000002168 | 2 | 0.25 | 0.074 |
| -0.0480000000002167 | 2 | 0.25 | 0.074 |
| -0.0440000000002167 | 2 | 0.25 | 0.074 |
| -0.0400000000002167 | 2 | 0.25 | 0.074 |
| -0.0360000000002167 | 2 | 0.25 | 0.074 |
| -0.0320000000002167 | 2 | 0.25 | 0.074 |
| -0.0280000000002167 | 2 | 0.25 | 0.074 |
| -0.0240000000002167 | 2 | 0.25 | 0.074 |
| -0.0200000000002167 | 2 | 0.25 | 0.074 |
| -0.0160000000002167 | 2 | 0.25 | 0.074 |
| -0.0120000000002167 | 2 | 0.25 | 0.074 |
| -0.00800000000021674 | 2 | 0.25 | 0.074 |
| -0.00400000000021674 | 2 | 0.25 | 0.074 |
| -2.16743289982446e-13 | 2 | 0.25 | 0.074 |
| 0.00399999999978326 | 2 | 0.25 | 0.074 |
| 0.00799999999978325 | 2 | 0.25 | 0.074 |
| 0.0119999999997833 | 2 | 0.25 | 0.074 |
| 0.0159999999997833 | 2 | 0.25 | 0.074 |
| 0.0199999999997833 | 2 | 0.25 | 0.074 |
| 0.0239999999997833 | 2 | 0.25 | 0.074 |
| 0.0279999999997833 | 2 | 0.25 | 0.074 |
| 0.0319999999997833 | 2 | 0.25 | 0.074 |
| 0.0359999999997833 | 2 | 0.25 | 0.074 |
| 0.0399999999997833 | 2 | 0.25 | 0.074 |
| 0.0439999999997833 | 2 | 0.25 | 0.074 |
| 0.0479999999997833 | 2 | 0.25 | 0.074 |
| 0.0519999999997833 | 2 | 0.25 | 0.074 |
| 0.0559999999997833 | 2 | 0.25 | 0.074 |
| 0.0599999999997833 | 2 | 0.25 | 0.074 |
| 0.0639999999997833 | 2 | 0.25 | 0.074 |
| 0.0679999999997833 | 2 | 0.25 | 0.074 |
| 0.0719999999997833 | 2 | 0.25 | 0.074 |
| 0.0759999999997833 | 2 | 0.25 | 0.074 |
| 0.0799999999997833 | 2 | 0.25 | 0.074 |
| 0.0839999999997833 | 2 | 0.25 | 0.074 |
| 0.0879999999997833 | 2 | 0.25 | 0.074 |
| 0.0919999999997833 | 2 | 0.25 | 0.074 |
| 0.0959999999997833 | 2 | 0.25 | 0.074 |
| 0.0999999999997833 | 2 | 0.25 | 0.074 |
| 0.103999999999783 | 2 | 0.25 | 0.075 |
| 0.107999999999783 | 2 | 0.25 | 0.075 |
| 0.111999999999783 | 2.001 | 0.251 | 0.075 |
| 0.115999999999783 | 2.001 | 0.251 | 0.075 |
| 0.119999999999783 | 2.001 | 0.251 | 0.075 |
| 0.123999999999783 | 2.001 | 0.251 | 0.075 |
| 0.127999999999783 | 2.001 | 0.251 | 0.075 |
| 0.131999999999783 | 2.001 | 0.251 | 0.075 |
| 0.135999999999783 | 2.001 | 0.251 | 0.075 |
| 0.139999999999783 | 2.001 | 0.251 | 0.075 |
| 0.143999999999783 | 2.001 | 0.251 | 0.075 |
| 0.147999999999783 | 2.001 | 0.251 | 0.076 |
| 0.151999999999783 | 2.001 | 0.251 | 0.076 |
| 0.155999999999783 | 2.001 | 0.252 | 0.076 |
| 0.159999999999783 | 2.002 | 0.252 | 0.076 |
| 0.163999999999783 | 2.002 | 0.252 | 0.076 |
| 0.167999999999783 | 2.002 | 0.252 | 0.076 |
| 0.171999999999783 | 2.002 | 0.252 | 0.077 |
| 0.175999999999783 | 2.002 | 0.252 | 0.077 |
| 0.179999999999783 | 2.002 | 0.253 | 0.077 |
| 0.183999999999783 | 2.002 | 0.253 | 0.077 |
| 0.187999999999783 | 2.003 | 0.253 | 0.077 |
| 0.191999999999783 | 2.003 | 0.253 | 0.078 |
| 0.195999999999783 | 2.003 | 0.253 | 0.078 |
| 0.199999999999783 | 2.003 | 0.254 | 0.078 |
| 0.203999999999783 | 2.003 | 0.254 | 0.079 |
| 0.207999999999783 | 2.004 | 0.254 | 0.079 |
| 0.211999999999783 | 2.004 | 0.254 | 0.079 |
| 0.215999999999783 | 2.004 | 0.255 | 0.08 |
| 0.219999999999783 | 2.004 | 0.255 | 0.08 |
| 0.223999999999783 | 2.004 | 0.255 | 0.08 |
| 0.227999999999783 | 2.005 | 0.256 | 0.081 |
| 0.231999999999783 | 2.005 | 0.256 | 0.081 |
| 0.235999999999783 | 2.005 | 0.256 | 0.082 |
| 0.239999999999783 | 2.006 | 0.257 | 0.082 |
| 0.243999999999783 | 2.006 | 0.257 | 0.083 |
| 0.247999999999783 | 2.006 | 0.257 | 0.083 |
| 0.251999999999783 | 2.006 | 0.258 | 0.084 |
| 0.255999999999783 | 2.007 | 0.258 | 0.084 |
| 0.259999999999783 | 2.007 | 0.259 | 0.085 |
| 0.263999999999783 | 2.007 | 0.259 | 0.085 |
| 0.267999999999783 | 2.008 | 0.26 | 0.086 |
| 0.271999999999783 | 2.008 | 0.26 | 0.087 |
| 0.275999999999783 | 2.009 | 0.261 | 0.087 |
| 0.279999999999783 | 2.009 | 0.261 | 0.088 |
| 0.283999999999783 | 2.009 | 0.262 | 0.089 |
| 0.287999999999783 | 2.01 | 0.262 | 0.09 |
| 0.291999999999783 | 2.01 | 0.263 | 0.09 |
| 0.295999999999783 | 2.011 | 0.264 | 0.091 |
| 0.299999999999783 | 2.011 | 0.264 | 0.092 |
| 0.303999999999783 | 2.012 | 0.265 | 0.093 |
| 0.307999999999783 | 2.012 | 0.266 | 0.094 |
| 0.311999999999783 | 2.013 | 0.266 | 0.095 |
| 0.315999999999783 | 2.013 | 0.267 | 0.096 |
| 0.319999999999783 | 2.014 | 0.268 | 0.097 |
| 0.323999999999783 | 2.014 | 0.269 | 0.098 |
| 0.327999999999783 | 2.015 | 0.269 | 0.099 |
| 0.331999999999783 | 2.016 | 0.27 | 0.1 |
| 0.335999999999783 | 2.016 | 0.271 | 0.101 |
| 0.339999999999783 | 2.017 | 0.272 | 0.103 |
| 0.343999999999783 | 2.018 | 0.273 | 0.104 |
| 0.347999999999783 | 2.018 | 0.274 | 0.105 |
| 0.351999999999783 | 2.019 | 0.275 | 0.107 |
| 0.355999999999783 | 2.02 | 0.276 | 0.108 |
| 0.359999999999783 | 2.02 | 0.277 | 0.11 |
| 0.363999999999783 | 2.021 | 0.278 | 0.111 |
| 0.367999999999783 | 2.022 | 0.279 | 0.113 |
| 0.371999999999784 | 2.023 | 0.28 | 0.115 |
| 0.375999999999784 | 2.024 | 0.281 | 0.116 |
| 0.379999999999784 | 2.024 | 0.283 | 0.118 |
| 0.383999999999784 | 2.025 | 0.284 | 0.12 |
| 0.387999999999784 | 2.026 | 0.285 | 0.122 |
| 0.391999999999784 | 2.027 | 0.287 | 0.124 |
| 0.395999999999784 | 2.028 | 0.288 | 0.126 |
| 0.399999999999784 | 2.029 | 0.289 | 0.128 |
| 0.403999999999784 | 2.03 | 0.291 | 0.13 |
| 0.407999999999784 | 2.031 | 0.292 | 0.132 |
| 0.411999999999784 | 2.032 | 0.294 | 0.135 |
| 0.415999999999784 | 2.033 | 0.295 | 0.137 |
| 0.419999999999784 | 2.034 | 0.297 | 0.139 |
| 0.423999999999784 | 2.035 | 0.299 | 0.142 |
| 0.427999999999784 | 2.036 | 0.3 | 0.145 |
| 0.431999999999784 | 2.037 | 0.302 | 0.147 |
| 0.435999999999784 | 2.038 | 0.304 | 0.15 |
| 0.439999999999784 | 2.04 | 0.306 | 0.153 |
| 0.443999999999784 | 2.041 | 0.308 | 0.156 |
| 0.447999999999784 | 2.042 | 0.31 | 0.159 |
| 0.451999999999784 | 2.043 | 0.312 | 0.162 |
| 0.455999999999784 | 2.045 | 0.314 | 0.165 |
| 0.459999999999784 | 2.046 | 0.316 | 0.168 |
| 0.463999999999784 | 2.047 | 0.318 | 0.172 |
| 0.467999999999784 | 2.049 | 0.32 | 0.175 |
| 0.471999999999784 | 2.05 | 0.322 | 0.179 |
| 0.475999999999784 | 2.052 | 0.325 | 0.183 |
| 0.479999999999784 | 2.053 | 0.327 | 0.187 |
| 0.483999999999784 | 2.055 | 0.329 | 0.191 |
| 0.487999999999784 | 2.056 | 0.332 | 0.195 |
| 0.491999999999784 | 2.058 | 0.334 | 0.199 |
| 0.495999999999784 | 2.059 | 0.337 | 0.203 |
| 0.499999999999784 | 2.061 | 0.34 | 0.207 |
| 0.503999999999784 | 2.063 | 0.343 | 0.212 |
| 0.507999999999784 | 2.064 | 0.345 | 0.217 |
| 0.511999999999784 | 2.066 | 0.348 | 0.222 |
| 0.515999999999784 | 2.068 | 0.351 | 0.226 |
| 0.519999999999784 | 2.07 | 0.354 | 0.232 |
| 0.523999999999784 | 2.071 | 0.357 | 0.237 |
| 0.527999999999784 | 2.073 | 0.36 | 0.242 |
| 0.531999999999784 | 2.075 | 0.364 | 0.248 |
| 0.535999999999784 | 2.077 | 0.367 | 0.253 |
| 0.539999999999784 | 2.079 | 0.37 | 0.259 |
| 0.543999999999784 | 2.081 | 0.374 | 0.265 |
| 0.547999999999784 | 2.083 | 0.377 | 0.271 |
| 0.551999999999784 | 2.085 | 0.381 | 0.278 |
| 0.555999999999784 | 2.087 | 0.385 | 0.284 |
| 0.559999999999784 | 2.09 | 0.389 | 0.291 |
| 0.563999999999784 | 2.092 | 0.393 | 0.297 |
| 0.567999999999784 | 2.094 | 0.396 | 0.304 |
| 0.571999999999784 | 2.096 | 0.401 | 0.312 |
| 0.575999999999784 | 2.099 | 0.405 | 0.319 |
| 0.579999999999784 | 2.101 | 0.409 | 0.327 |
| 0.583999999999784 | 2.104 | 0.413 | 0.334 |
| 0.587999999999784 | 2.106 | 0.418 | 0.342 |
| 0.591999999999784 | 2.109 | 0.422 | 0.35 |
| 0.595999999999784 | 2.111 | 0.427 | 0.359 |
| 0.599999999999784 | 2.114 | 0.432 | 0.367 |
| 0.603999999999784 | 2.116 | 0.436 | 0.376 |
| 0.607999999999784 | 2.119 | 0.441 | 0.385 |
| 0.611999999999784 | 2.122 | 0.446 | 0.395 |
| 0.615999999999784 | 2.125 | 0.452 | 0.404 |
| 0.619999999999784 | 2.127 | 0.457 | 0.414 |
| 0.623999999999784 | 2.13 | 0.462 | 0.424 |
| 0.627999999999784 | 2.133 | 0.468 | 0.434 |
| 0.631999999999784 | 2.136 | 0.473 | 0.445 |
| 0.635999999999784 | 2.139 | 0.479 | 0.455 |
| 0.639999999999784 | 2.142 | 0.485 | 0.466 |
| 0.643999999999784 | 2.145 | 0.491 | 0.478 |
| 0.647999999999784 | 2.149 | 0.497 | 0.489 |
| 0.651999999999784 | 2.152 | 0.503 | 0.501 |
| 0.655999999999784 | 2.155 | 0.509 | 0.513 |
| 0.659999999999784 | 2.158 | 0.516 | 0.526 |
| 0.663999999999784 | 2.162 | 0.522 | 0.539 |
| 0.667999999999784 | 2.165 | 0.529 | 0.552 |
| 0.671999999999784 | 2.169 | 0.536 | 0.565 |
| 0.675999999999784 | 2.172 | 0.543 | 0.579 |
| 0.679999999999784 | 2.176 | 0.55 | 0.593 |
| 0.683999999999784 | 2.18 | 0.557 | 0.607 |
| 0.687999999999784 | 2.183 | 0.565 | 0.622 |
| 0.691999999999784 | 2.187 | 0.572 | 0.637 |
| 0.695999999999784 | 2.191 | 0.58 | 0.653 |
| 0.699999999999784 | 2.195 | 0.588 | 0.668 |
| 0.703999999999784 | 2.199 | 0.596 | 0.685 |
| 0.707999999999784 | 2.203 | 0.604 | 0.701 |
| 0.711999999999784 | 2.207 | 0.613 | 0.718 |
| 0.715999999999784 | 2.211 | 0.621 | 0.736 |
| 0.719999999999784 | 2.216 | 0.63 | 0.753 |
| 0.723999999999784 | 2.22 | 0.639 | 0.771 |
| 0.727999999999784 | 2.224 | 0.648 | 0.79 |
| 0.731999999999784 | 2.229 | 0.657 | 0.809 |
| 0.735999999999784 | 2.233 | 0.666 | 0.829 |
| 0.739999999999784 | 2.238 | 0.676 | 0.849 |
| 0.743999999999784 | 2.242 | 0.685 | 0.869 |
| 0.747999999999784 | 2.247 | 0.695 | 0.89 |
| 0.751999999999784 | 2.252 | 0.705 | 0.911 |
| 0.755999999999784 | 2.257 | 0.716 | 0.933 |
| 0.759999999999784 | 2.261 | 0.726 | 0.955 |
| 0.763999999999784 | 2.266 | 0.737 | 0.978 |
| 0.767999999999784 | 2.271 | 0.748 | 1.002 |
| 0.771999999999784 | 2.277 | 0.759 | 1.025 |
| 0.775999999999784 | 2.282 | 0.77 | 1.05 |
| 0.779999999999784 | 2.287 | 0.781 | 1.075 |
| 0.783999999999784 | 2.292 | 0.793 | 1.1 |
| 0.787999999999784 | 2.298 | 0.805 | 1.127 |
| 0.791999999999784 | 2.303 | 0.817 | 1.153 |
| 0.795999999999784 | 2.309 | 0.829 | 1.181 |
| 0.799999999999784 | 2.315 | 0.842 | 1.208 |
| 0.803999999999784 | 2.32 | 0.855 | 1.237 |
| 0.807999999999784 | 2.326 | 0.868 | 1.266 |
| 0.811999999999784 | 2.332 | 0.881 | 1.296 |
| 0.815999999999784 | 2.338 | 0.895 | 1.326 |
| 0.819999999999784 | 2.344 | 0.908 | 1.358 |
| 0.823999999999784 | 2.35 | 0.922 | 1.389 |
| 0.827999999999784 | 2.356 | 0.937 | 1.422 |
| 0.831999999999784 | 2.363 | 0.951 | 1.455 |
| 0.835999999999784 | 2.369 | 0.966 | 1.489 |
| 0.839999999999784 | 2.376 | 0.981 | 1.524 |
| 0.843999999999784 | 2.382 | 0.996 | 1.559 |
| 0.847999999999784 | 2.389 | 1.012 | 1.596 |
| 0.851999999999784 | 2.396 | 1.027 | 1.633 |
| 0.855999999999784 | 2.403 | 1.044 | 1.67 |
| 0.859999999999784 | 2.409 | 1.06 | 1.709 |
| 0.863999999999784 | 2.417 | 1.077 | 1.748 |
| 0.867999999999784 | 2.424 | 1.094 | 1.789 |
| 0.871999999999784 | 2.431 | 1.111 | 1.83 |
| 0.875999999999784 | 2.438 | 1.128 | 1.872 |
| 0.879999999999784 | 2.446 | 1.146 | 1.915 |
| 0.883999999999784 | 2.453 | 1.164 | 1.959 |
| 0.887999999999784 | 2.461 | 1.183 | 2.004 |
| 0.891999999999784 | 2.468 | 1.202 | 2.049 |
| 0.895999999999784 | 2.476 | 1.221 | 2.096 |
| 0.899999999999784 | 2.484 | 1.24 | 2.144 |
| 0.903999999999784 | 2.492 | 1.26 | 2.193 |
| 0.907999999999784 | 2.5 | 1.28 | 2.242 |
| 0.911999999999784 | 2.509 | 1.3 | 2.293 |
| 0.915999999999784 | 2.517 | 1.321 | 2.345 |
| 0.919999999999784 | 2.525 | 1.342 | 2.398 |
| 0.923999999999784 | 2.534 | 1.364 | 2.452 |
| 0.927999999999784 | 2.543 | 1.386 | 2.507 |
| 0.931999999999784 | 2.551 | 1.408 | 2.563 |
| 0.935999999999784 | 2.56 | 1.431 | 2.621 |
| 0.939999999999784 | 2.569 | 1.454 | 2.68 |
| 0.943999999999784 | 2.578 | 1.477 | 2.739 |
| 0.947999999999784 | 2.588 | 1.501 | 2.801 |
| 0.951999999999784 | 2.597 | 1.525 | 2.863 |
| 0.955999999999784 | 2.606 | 1.549 | 2.927 |
| 0.959999999999784 | 2.616 | 1.574 | 2.992 |
| 0.963999999999784 | 2.626 | 1.6 | 3.058 |
| 0.967999999999784 | 2.635 | 1.625 | 3.126 |
| 0.971999999999784 | 2.645 | 1.652 | 3.195 |
| 0.975999999999784 | 2.655 | 1.678 | 3.265 |
| 0.979999999999784 | 2.666 | 1.705 | 3.337 |
| 0.983999999999784 | 2.676 | 1.733 | 3.411 |
| 0.987999999999784 | 2.686 | 1.761 | 3.486 |
| 0.991999999999784 | 2.697 | 1.789 | 3.562 |
| 0.995999999999784 | 2.707 | 1.818 | 3.64 |
| 0.999999999999784 | 2.718 | 1.847 | 3.72 |
| 1.003999999999784 | 2.729 | 1.877 | 3.801 |
| 1.007999999999784 | 2.74 | 1.907 | 3.883 |
| 1.011999999999784 | 2.751 | 1.938 | 3.968 |
| 1.015999999999784 | 2.763 | 1.969 | 4.054 |
| 1.019999999999784 | 2.774 | 2.001 | 4.142 |
| 1.023999999999784 | 2.786 | 2.033 | 4.232 |
| 1.027999999999784 | 2.798 | 2.066 | 4.323 |
| 1.031999999999784 | 2.81 | 2.099 | 4.416 |
| 1.035999999999784 | 2.822 | 2.133 | 4.511 |
| 1.039999999999784 | 2.834 | 2.168 | 4.608 |
| 1.043999999999784 | 2.846 | 2.203 | 4.707 |
| 1.047999999999784 | 2.859 | 2.238 | 4.808 |
| 1.051999999999784 | 2.871 | 2.274 | 4.911 |
| 1.055999999999784 | 2.884 | 2.311 | 5.016 |
| 1.059999999999784 | 2.897 | 2.348 | 5.123 |
| 1.063999999999784 | 2.91 | 2.385 | 5.232 |
| 1.067999999999784 | 2.923 | 2.424 | 5.344 |
| 1.071999999999784 | 2.936 | 2.463 | 5.457 |
| 1.075999999999784 | 2.95 | 2.502 | 5.573 |
| 1.079999999999784 | 2.964 | 2.542 | 5.691 |
| 1.083999999999784 | 2.977 | 2.583 | 5.811 |
| 1.087999999999784 | 2.991 | 2.625 | 5.934 |
| 1.091999999999784 | 3.005 | 2.667 | 6.059 |
| 1.095999999999784 | 3.02 | 2.709 | 6.186 |
| 1.099999999999784 | 3.034 | 2.753 | 6.316 |
| 1.103999999999784 | 3.049 | 2.797 | 6.449 |
| 1.107999999999784 | 3.064 | 2.841 | 6.584 |
| 1.111999999999784 | 3.079 | 2.887 | 6.722 |
| 1.115999999999784 | 3.094 | 2.933 | 6.862 |
| 1.119999999999784 | 3.109 | 2.98 | 7.005 |
| 1.123999999999784 | 3.124 | 3.027 | 7.151 |
| 1.127999999999784 | 3.14 | 3.075 | 7.299 |
| 1.131999999999784 | 3.156 | 3.124 | 7.451 |
| 1.135999999999784 | 3.172 | 3.174 | 7.605 |
| 1.139999999999784 | 3.188 | 3.224 | 7.763 |
| 1.143999999999784 | 3.204 | 3.276 | 7.923 |
| 1.147999999999784 | 3.221 | 3.328 | 8.087 |
| 1.151999999999784 | 3.238 | 3.38 | 8.253 |
| 1.155999999999784 | 3.255 | 3.434 | 8.423 |
| 1.159999999999784 | 3.272 | 3.488 | 8.596 |
| 1.163999999999784 | 3.289 | 3.543 | 8.773 |
| 1.167999999999784 | 3.306 | 3.599 | 8.952 |
| 1.171999999999784 | 3.324 | 3.656 | 9.136 |
| 1.175999999999784 | 3.342 | 3.714 | 9.322 |
| 1.179999999999784 | 3.36 | 3.772 | 9.512 |
| 1.183999999999784 | 3.378 | 3.832 | 9.706 |
| 1.187999999999784 | 3.396 | 3.892 | 9.904 |
| 1.191999999999784 | 3.415 | 3.953 | 10.105 |
| 1.195999999999784 | 3.434 | 4.016 | 10.31 |
| 1.199999999999784 | 3.453 | 4.079 | 10.519 |
| 1.203999999999784 | 3.472 | 4.143 | 10.731 |
| 1.207999999999784 | 3.492 | 4.207 | 10.948 |
| 1.211999999999784 | 3.511 | 4.273 | 11.169 |
| 1.215999999999784 | 3.531 | 4.34 | 11.394 |
| 1.219999999999784 | 3.551 | 4.408 | 11.623 |
| 1.223999999999784 | 3.571 | 4.477 | 11.857 |
| 1.227999999999784 | 3.592 | 4.547 | 12.095 |
| 1.231999999999784 | 3.613 | 4.617 | 12.337 |
| 1.235999999999784 | 3.634 | 4.689 | 12.584 |
| 1.239999999999784 | 3.655 | 4.762 | 12.835 |
| 1.243999999999784 | 3.676 | 4.836 | 13.092 |
| 1.247999999999784 | 3.698 | 4.911 | 13.352 |
| 1.251999999999784 | 3.719 | 4.987 | 13.618 |
| 1.255999999999784 | 3.741 | 5.065 | 13.889 |
| 1.259999999999784 | 3.764 | 5.143 | 14.165 |
| 1.263999999999784 | 3.786 | 5.222 | 14.445 |
| 1.267999999999784 | 3.809 | 5.303 | 14.731 |
| 1.271999999999784 | 3.832 | 5.385 | 15.023 |
| 1.275999999999784 | 3.855 | 5.468 | 15.319 |
| 1.279999999999784 | 3.879 | 5.552 | 15.622 |
| 1.283999999999784 | 3.902 | 5.637 | 15.929 |
| 1.287999999999784 | 3.926 | 5.724 | 16.243 |
| 1.291999999999784 | 3.95 | 5.812 | 16.562 |
| 1.295999999999784 | 3.975 | 5.901 | 16.887 |
| 1.299999999999784 | 4 | 5.991 | 17.218 |
| 1.303999999999784 | 4.024 | 6.083 | 17.555 |
| 1.307999999999784 | 4.05 | 6.176 | 17.898 |
| 1.311999999999784 | 4.075 | 6.27 | 18.247 |
| 1.315999999999784 | 4.101 | 6.366 | 18.603 |
| 1.319999999999784 | 4.127 | 6.463 | 18.965 |
| 1.323999999999784 | 4.153 | 6.561 | 19.334 |
| 1.327999999999784 | 4.179 | 6.661 | 19.71 |
| 1.331999999999784 | 4.206 | 6.762 | 20.093 |
| 1.335999999999784 | 4.233 | 6.865 | 20.482 |
| 1.339999999999784 | 4.261 | 6.969 | 20.878 |
| 1.343999999999784 | 4.288 | 7.074 | 21.282 |
| 1.347999999999784 | 4.316 | 7.181 | 21.693 |
| 1.351999999999784 | 4.344 | 7.29 | 22.112 |
| 1.355999999999784 | 4.372 | 7.4 | 22.538 |
| 1.359999999999784 | 4.401 | 7.511 | 22.971 |
| 1.363999999999784 | 4.43 | 7.624 | 23.413 |
| 1.367999999999784 | 4.459 | 7.739 | 23.862 |
| 1.371999999999784 | 4.489 | 7.855 | 24.32 |
| 1.375999999999784 | 4.519 | 7.973 | 24.786 |
| 1.379999999999784 | 4.549 | 8.093 | 25.26 |
| 1.383999999999784 | 4.579 | 8.214 | 25.742 |
| 1.387999999999784 | 4.61 | 8.337 | 26.234 |
| 1.391999999999784 | 4.641 | 8.461 | 26.734 |
| 1.395999999999784 | 4.672 | 8.588 | 27.243 |
| 1.399999999999784 | 4.704 | 8.716 | 27.761 |
| 1.403999999999784 | 4.736 | 8.845 | 28.289 |
| 1.407999999999784 | 4.768 | 8.977 | 28.826 |
| 1.411999999999784 | 4.801 | 9.11 | 29.372 |
| 1.415999999999784 | 4.834 | 9.246 | 29.928 |
| 1.419999999999784 | 4.867 | 9.383 | 30.494 |
| 1.423999999999784 | 4.9 | 9.522 | 31.071 |
| 1.427999999999784 | 4.934 | 9.663 | 31.657 |
| 1.431999999999784 | 4.968 | 9.806 | 32.254 |
| 1.435999999999784 | 5.003 | 9.95 | 32.861 |
| 1.439999999999784 | 5.038 | 10.097 | 33.48 |
| 1.443999999999784 | 5.073 | 10.246 | 34.109 |
| 1.447999999999784 | 5.109 | 10.397 | 34.749 |
| 1.451999999999784 | 5.144 | 10.55 | 35.401 |
| 1.455999999999784 | 5.181 | 10.704 | 36.064 |
| 1.459999999999784 | 5.217 | 10.861 | 36.739 |
| 1.463999999999784 | 5.254 | 11.021 | 37.425 |
| 1.467999999999784 | 5.291 | 11.182 | 38.124 |
| 1.471999999999784 | 5.329 | 11.345 | 38.835 |
| 1.475999999999784 | 5.367 | 11.511 | 39.559 |
| 1.479999999999784 | 5.405 | 11.679 | 40.295 |
| 1.483999999999784 | 5.444 | 11.849 | 41.044 |
| 1.487999999999784 | 5.483 | 12.022 | 41.807 |
| 1.491999999999784 | 5.522 | 12.197 | 42.583 |
| 1.495999999999784 | 5.562 | 12.374 | 43.372 |
| 1.499999999999784 | 5.602 | 12.553 | 44.175 |
| 1.503999999999784 | 5.643 | 12.735 | 44.992 |
| 1.507999999999784 | 5.684 | 12.92 | 45.824 |
| 1.511999999999784 | 5.725 | 13.107 | 46.67 |
| 1.515999999999784 | 5.766 | 13.296 | 47.531 |
| 1.519999999999784 | 5.809 | 13.488 | 48.406 |
| 1.523999999999784 | 5.851 | 13.683 | 49.297 |
| 1.527999999999784 | 5.894 | 13.88 | 50.204 |
| 1.531999999999784 | 5.937 | 14.079 | 51.126 |
| 1.535999999999784 | 5.981 | 14.282 | 52.064 |
| 1.539999999999784 | 6.025 | 14.487 | 53.019 |
| 1.543999999999784 | 6.069 | 14.695 | 53.99 |
| 1.547999999999784 | 6.114 | 14.905 | 54.978 |
| 1.551999999999784 | 6.159 | 15.118 | 55.983 |
| 1.555999999999784 | 6.205 | 15.335 | 57.006 |
| 1.559999999999784 | 6.251 | 15.554 | 58.046 |
| 1.563999999999784 | 6.298 | 15.775 | 59.104 |
| 1.567999999999784 | 6.345 | 16 | 60.18 |
| 1.571999999999784 | 6.392 | 16.228 | 61.275 |
| 1.575999999999784 | 6.44 | 16.459 | 62.389 |
| 1.579999999999784 | 6.488 | 16.693 | 63.522 |
| 1.583999999999784 | 6.537 | 16.93 | 64.674 |
| 1.587999999999784 | 6.586 | 17.17 | 65.847 |
| 1.591999999999784 | 6.636 | 17.413 | 67.039 |
| 1.595999999999784 | 6.686 | 17.659 | 68.252 |
| 1.599999999999784 | 6.736 | 17.909 | 69.486 |
| 1.603999999999784 | 6.787 | 18.162 | 70.741 |
| 1.607999999999784 | 6.838 | 18.418 | 72.017 |
| 1.611999999999784 | 6.89 | 18.677 | 73.316 |
| 1.615999999999784 | 6.943 | 18.94 | 74.636 |
| 1.619999999999784 | 6.995 | 19.206 | 75.979 |
| 1.623999999999784 | 7.049 | 19.476 | 77.345 |
| 1.627999999999784 | 7.103 | 19.75 | 78.734 |
| 1.631999999999784 | 7.157 | 20.026 | 80.147 |
| 1.635999999999784 | 7.212 | 20.307 | 81.584 |
| 1.639999999999784 | 7.267 | 20.591 | 83.046 |
| 1.643999999999784 | 7.322 | 20.879 | 84.532 |
| 1.647999999999784 | 7.379 | 21.17 | 86.044 |
| 1.651999999999784 | 7.435 | 21.465 | 87.581 |
| 1.655999999999784 | 7.493 | 21.764 | 89.145 |
| 1.659999999999784 | 7.55 | 22.067 | 90.735 |
| 1.663999999999784 | 7.608 | 22.374 | 92.352 |
| 1.667999999999784 | 7.667 | 22.685 | 93.997 |
| 1.671999999999784 | 7.726 | 23 | 95.669 |
| 1.675999999999784 | 7.786 | 23.319 | 97.369 |
| 1.679999999999784 | 7.847 | 23.642 | 99.099 |
| 1.683999999999784 | 7.907 | 23.969 | 100.857 |
| 1.687999999999784 | 7.969 | 24.3 | 102.646 |
| 1.691999999999784 | 8.031 | 24.636 | 104.464 |
| 1.695999999999784 | 8.093 | 24.975 | 106.313 |
| 1.699999999999784 | 8.156 | 25.32 | 108.194 |
| 1.703999999999785 | 8.22 | 25.668 | 110.106 |
| 1.707999999999785 | 8.284 | 26.021 | 112.05 |
| 1.711999999999785 | 8.349 | 26.379 | 114.027 |
| 1.715999999999785 | 8.414 | 26.741 | 116.037 |
| 1.719999999999785 | 8.48 | 27.108 | 118.081 |
| 1.723999999999785 | 8.546 | 27.479 | 120.159 |
| 1.727999999999785 | 8.613 | 27.855 | 122.272 |
| 1.731999999999785 | 8.68 | 28.236 | 124.421 |
| 1.735999999999785 | 8.749 | 28.622 | 126.605 |
| 1.739999999999785 | 8.817 | 29.012 | 128.827 |
| 1.743999999999785 | 8.887 | 29.408 | 131.085 |
| 1.747999999999785 | 8.956 | 29.809 | 133.381 |
| 1.751999999999785 | 9.027 | 30.214 | 135.715 |
| 1.755999999999785 | 9.098 | 30.625 | 138.089 |
| 1.759999999999785 | 9.17 | 31.041 | 140.502 |
| 1.763999999999785 | 9.242 | 31.462 | 142.955 |
| 1.767999999999785 | 9.315 | 31.889 | 145.449 |
| 1.771999999999785 | 9.389 | 32.321 | 147.985 |
| 1.775999999999785 | 9.463 | 32.758 | 150.563 |
| 1.779999999999785 | 9.538 | 33.201 | 153.184 |
| 1.783999999999785 | 9.613 | 33.65 | 155.849 |
| 1.787999999999785 | 9.689 | 34.104 | 158.558 |
| 1.791999999999785 | 9.766 | 34.563 | 161.311 |
| 1.795999999999785 | 9.843 | 35.029 | 164.111 |
| 1.799999999999785 | 9.921 | 35.5 | 166.957 |
| 1.803999999999785 | 10 | 35.978 | 169.85 |
| 1.807999999999785 | 10.08 | 36.461 | 172.791 |
| 1.811999999999785 | 10.16 | 36.95 | 175.781 |
| 1.815999999999785 | 10.24 | 37.446 | 178.82 |
| 1.819999999999785 | 10.322 | 37.947 | 181.91 |
| 1.823999999999785 | 10.404 | 38.455 | 185.05 |
| 1.827999999999785 | 10.487 | 38.969 | 188.243 |
| 1.831999999999785 | 10.57 | 39.49 | 191.488 |
| 1.835999999999785 | 10.654 | 40.017 | 194.787 |
| 1.839999999999785 | 10.739 | 40.55 | 198.14 |
| 1.843999999999785 | 10.825 | 41.091 | 201.548 |
| 1.847999999999785 | 10.911 | 41.638 | 205.013 |
| 1.851999999999785 | 10.998 | 42.191 | 208.535 |
| 1.855999999999785 | 11.086 | 42.752 | 212.114 |
| 1.859999999999785 | 11.175 | 43.319 | 215.753 |
| 1.863999999999785 | 11.264 | 43.894 | 219.451 |
| 1.867999999999785 | 11.354 | 44.476 | 223.21 |
| 1.871999999999785 | 11.445 | 45.064 | 227.03 |
| 1.875999999999785 | 11.536 | 45.661 | 230.914 |
| 1.879999999999785 | 11.629 | 46.264 | 234.861 |
| 1.883999999999785 | 11.722 | 46.875 | 238.873 |
| 1.887999999999785 | 11.815 | 47.493 | 242.95 |
| 1.891999999999785 | 11.91 | 48.119 | 247.094 |
| 1.895999999999785 | 12.005 | 48.753 | 251.306 |
| 1.899999999999785 | 12.101 | 49.395 | 255.587 |
| 1.903999999999785 | 12.198 | 50.044 | 259.938 |
| 1.907999999999785 | 12.296 | 50.702 | 264.36 |
| 1.911999999999785 | 12.395 | 51.367 | 268.854 |
| 1.915999999999785 | 12.494 | 52.041 | 273.421 |
| 1.919999999999785 | 12.594 | 52.723 | 278.063 |
| 1.923999999999785 | 12.695 | 53.413 | 282.78 |
| 1.927999999999785 | 12.797 | 54.112 | 287.575 |
| 1.931999999999785 | 12.9 | 54.819 | 292.447 |
| 1.935999999999785 | 13.003 | 55.535 | 297.399 |
| 1.939999999999785 | 13.108 | 56.259 | 302.431 |
| 1.943999999999785 | 13.213 | 56.993 | 307.545 |
| 1.947999999999785 | 13.319 | 57.735 | 312.742 |
| 1.951999999999785 | 13.426 | 58.486 | 318.024 |
| 1.955999999999785 | 13.533 | 59.247 | 323.391 |
| 1.959999999999785 | 13.642 | 60.017 | 328.845 |
| 1.963999999999785 | 13.752 | 60.796 | 334.388 |
| 1.967999999999785 | 13.862 | 61.585 | 340.02 |
| 1.971999999999785 | 13.973 | 62.383 | 345.744 |
| 1.975999999999785 | 14.086 | 63.191 | 351.56 |
| 1.979999999999785 | 14.199 | 64.008 | 357.471 |
| 1.983999999999785 | 14.313 | 64.836 | 363.477 |
| 1.987999999999785 | 14.428 | 65.674 | 369.58 |
| 1.991999999999785 | 14.544 | 66.521 | 375.782 |
| 1.995999999999785 | 14.66 | 67.379 | 382.083 |
| 1.999999999999785 | 14.778 | 68.248 | 388.487 |